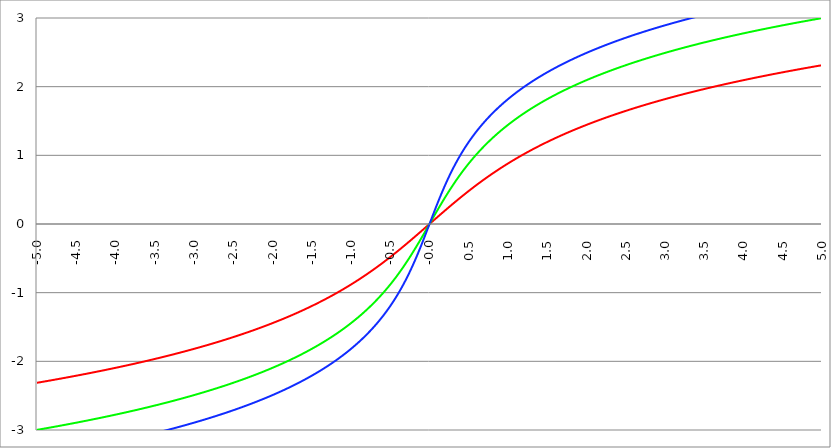
| Category | Series 1 | Series 0 | Series 2 |
|---|---|---|---|
| -5.0 | -2.312 | -2.998 | -3.402 |
| -4.995 | -2.311 | -2.997 | -3.401 |
| -4.99 | -2.31 | -2.996 | -3.4 |
| -4.985 | -2.309 | -2.995 | -3.399 |
| -4.98 | -2.309 | -2.994 | -3.398 |
| -4.975 | -2.308 | -2.993 | -3.397 |
| -4.97 | -2.307 | -2.992 | -3.396 |
| -4.965000000000001 | -2.306 | -2.991 | -3.395 |
| -4.960000000000001 | -2.305 | -2.99 | -3.394 |
| -4.955000000000001 | -2.304 | -2.989 | -3.393 |
| -4.950000000000001 | -2.303 | -2.988 | -3.392 |
| -4.945000000000001 | -2.302 | -2.987 | -3.391 |
| -4.940000000000001 | -2.301 | -2.986 | -3.39 |
| -4.935000000000001 | -2.3 | -2.985 | -3.389 |
| -4.930000000000001 | -2.299 | -2.984 | -3.388 |
| -4.925000000000002 | -2.298 | -2.983 | -3.387 |
| -4.920000000000002 | -2.297 | -2.982 | -3.386 |
| -4.915000000000002 | -2.296 | -2.981 | -3.385 |
| -4.910000000000002 | -2.295 | -2.98 | -3.384 |
| -4.905000000000002 | -2.294 | -2.979 | -3.383 |
| -4.900000000000002 | -2.293 | -2.978 | -3.382 |
| -4.895000000000002 | -2.292 | -2.977 | -3.381 |
| -4.890000000000002 | -2.291 | -2.976 | -3.38 |
| -4.885000000000002 | -2.29 | -2.975 | -3.379 |
| -4.880000000000002 | -2.289 | -2.974 | -3.378 |
| -4.875000000000003 | -2.288 | -2.973 | -3.377 |
| -4.870000000000003 | -2.287 | -2.972 | -3.376 |
| -4.865000000000003 | -2.286 | -2.971 | -3.375 |
| -4.860000000000003 | -2.285 | -2.97 | -3.374 |
| -4.855000000000003 | -2.284 | -2.969 | -3.373 |
| -4.850000000000003 | -2.283 | -2.968 | -3.372 |
| -4.845000000000003 | -2.282 | -2.967 | -3.371 |
| -4.840000000000003 | -2.281 | -2.966 | -3.37 |
| -4.835000000000003 | -2.28 | -2.965 | -3.369 |
| -4.830000000000004 | -2.279 | -2.964 | -3.368 |
| -4.825000000000004 | -2.278 | -2.963 | -3.367 |
| -4.820000000000004 | -2.277 | -2.962 | -3.366 |
| -4.815000000000004 | -2.275 | -2.961 | -3.365 |
| -4.810000000000004 | -2.274 | -2.96 | -3.364 |
| -4.805000000000004 | -2.273 | -2.959 | -3.363 |
| -4.800000000000004 | -2.272 | -2.958 | -3.362 |
| -4.795000000000004 | -2.271 | -2.957 | -3.361 |
| -4.790000000000004 | -2.27 | -2.956 | -3.359 |
| -4.785000000000004 | -2.269 | -2.954 | -3.358 |
| -4.780000000000004 | -2.268 | -2.953 | -3.357 |
| -4.775000000000004 | -2.267 | -2.952 | -3.356 |
| -4.770000000000004 | -2.266 | -2.951 | -3.355 |
| -4.765000000000005 | -2.265 | -2.95 | -3.354 |
| -4.760000000000005 | -2.264 | -2.949 | -3.353 |
| -4.755000000000005 | -2.263 | -2.948 | -3.352 |
| -4.750000000000005 | -2.262 | -2.947 | -3.351 |
| -4.745000000000005 | -2.261 | -2.946 | -3.35 |
| -4.740000000000005 | -2.26 | -2.945 | -3.349 |
| -4.735000000000005 | -2.259 | -2.944 | -3.348 |
| -4.730000000000005 | -2.258 | -2.943 | -3.347 |
| -4.725000000000006 | -2.257 | -2.942 | -3.346 |
| -4.720000000000006 | -2.256 | -2.941 | -3.345 |
| -4.715000000000006 | -2.255 | -2.94 | -3.344 |
| -4.710000000000006 | -2.254 | -2.939 | -3.343 |
| -4.705000000000006 | -2.253 | -2.938 | -3.342 |
| -4.700000000000006 | -2.252 | -2.937 | -3.341 |
| -4.695000000000006 | -2.251 | -2.936 | -3.34 |
| -4.690000000000006 | -2.25 | -2.935 | -3.338 |
| -4.685000000000007 | -2.249 | -2.933 | -3.337 |
| -4.680000000000007 | -2.248 | -2.932 | -3.336 |
| -4.675000000000007 | -2.247 | -2.931 | -3.335 |
| -4.670000000000007 | -2.246 | -2.93 | -3.334 |
| -4.665000000000007 | -2.245 | -2.929 | -3.333 |
| -4.660000000000007 | -2.243 | -2.928 | -3.332 |
| -4.655000000000007 | -2.242 | -2.927 | -3.331 |
| -4.650000000000007 | -2.241 | -2.926 | -3.33 |
| -4.645000000000007 | -2.24 | -2.925 | -3.329 |
| -4.640000000000008 | -2.239 | -2.924 | -3.328 |
| -4.635000000000008 | -2.238 | -2.923 | -3.327 |
| -4.630000000000008 | -2.237 | -2.922 | -3.326 |
| -4.625000000000008 | -2.236 | -2.921 | -3.325 |
| -4.620000000000008 | -2.235 | -2.92 | -3.323 |
| -4.615000000000008 | -2.234 | -2.919 | -3.322 |
| -4.610000000000008 | -2.233 | -2.917 | -3.321 |
| -4.605000000000008 | -2.232 | -2.916 | -3.32 |
| -4.600000000000008 | -2.231 | -2.915 | -3.319 |
| -4.595000000000009 | -2.23 | -2.914 | -3.318 |
| -4.590000000000009 | -2.229 | -2.913 | -3.317 |
| -4.585000000000009 | -2.228 | -2.912 | -3.316 |
| -4.580000000000009 | -2.227 | -2.911 | -3.315 |
| -4.57500000000001 | -2.225 | -2.91 | -3.314 |
| -4.57000000000001 | -2.224 | -2.909 | -3.313 |
| -4.565000000000009 | -2.223 | -2.908 | -3.312 |
| -4.560000000000009 | -2.222 | -2.907 | -3.31 |
| -4.555000000000009 | -2.221 | -2.906 | -3.309 |
| -4.55000000000001 | -2.22 | -2.904 | -3.308 |
| -4.54500000000001 | -2.219 | -2.903 | -3.307 |
| -4.54000000000001 | -2.218 | -2.902 | -3.306 |
| -4.53500000000001 | -2.217 | -2.901 | -3.305 |
| -4.53000000000001 | -2.216 | -2.9 | -3.304 |
| -4.52500000000001 | -2.215 | -2.899 | -3.303 |
| -4.52000000000001 | -2.214 | -2.898 | -3.302 |
| -4.51500000000001 | -2.213 | -2.897 | -3.301 |
| -4.51000000000001 | -2.212 | -2.896 | -3.299 |
| -4.505000000000011 | -2.21 | -2.895 | -3.298 |
| -4.500000000000011 | -2.209 | -2.893 | -3.297 |
| -4.495000000000011 | -2.208 | -2.892 | -3.296 |
| -4.490000000000011 | -2.207 | -2.891 | -3.295 |
| -4.485000000000011 | -2.206 | -2.89 | -3.294 |
| -4.480000000000011 | -2.205 | -2.889 | -3.293 |
| -4.475000000000011 | -2.204 | -2.888 | -3.292 |
| -4.470000000000011 | -2.203 | -2.887 | -3.291 |
| -4.465000000000011 | -2.202 | -2.886 | -3.289 |
| -4.460000000000011 | -2.201 | -2.885 | -3.288 |
| -4.455000000000012 | -2.2 | -2.883 | -3.287 |
| -4.450000000000012 | -2.198 | -2.882 | -3.286 |
| -4.445000000000012 | -2.197 | -2.881 | -3.285 |
| -4.440000000000012 | -2.196 | -2.88 | -3.284 |
| -4.435000000000012 | -2.195 | -2.879 | -3.283 |
| -4.430000000000012 | -2.194 | -2.878 | -3.282 |
| -4.425000000000012 | -2.193 | -2.877 | -3.28 |
| -4.420000000000012 | -2.192 | -2.876 | -3.279 |
| -4.415000000000012 | -2.191 | -2.874 | -3.278 |
| -4.410000000000013 | -2.19 | -2.873 | -3.277 |
| -4.405000000000013 | -2.189 | -2.872 | -3.276 |
| -4.400000000000013 | -2.187 | -2.871 | -3.275 |
| -4.395000000000013 | -2.186 | -2.87 | -3.274 |
| -4.390000000000013 | -2.185 | -2.869 | -3.273 |
| -4.385000000000013 | -2.184 | -2.868 | -3.271 |
| -4.380000000000013 | -2.183 | -2.867 | -3.27 |
| -4.375000000000013 | -2.182 | -2.865 | -3.269 |
| -4.370000000000013 | -2.181 | -2.864 | -3.268 |
| -4.365000000000013 | -2.18 | -2.863 | -3.267 |
| -4.360000000000014 | -2.179 | -2.862 | -3.266 |
| -4.355000000000014 | -2.177 | -2.861 | -3.265 |
| -4.350000000000014 | -2.176 | -2.86 | -3.263 |
| -4.345000000000014 | -2.175 | -2.859 | -3.262 |
| -4.340000000000014 | -2.174 | -2.857 | -3.261 |
| -4.335000000000014 | -2.173 | -2.856 | -3.26 |
| -4.330000000000014 | -2.172 | -2.855 | -3.259 |
| -4.325000000000014 | -2.171 | -2.854 | -3.258 |
| -4.320000000000014 | -2.17 | -2.853 | -3.256 |
| -4.315000000000015 | -2.168 | -2.852 | -3.255 |
| -4.310000000000015 | -2.167 | -2.851 | -3.254 |
| -4.305000000000015 | -2.166 | -2.849 | -3.253 |
| -4.300000000000015 | -2.165 | -2.848 | -3.252 |
| -4.295000000000015 | -2.164 | -2.847 | -3.251 |
| -4.290000000000015 | -2.163 | -2.846 | -3.25 |
| -4.285000000000015 | -2.162 | -2.845 | -3.248 |
| -4.280000000000015 | -2.16 | -2.844 | -3.247 |
| -4.275000000000015 | -2.159 | -2.842 | -3.246 |
| -4.270000000000015 | -2.158 | -2.841 | -3.245 |
| -4.265000000000016 | -2.157 | -2.84 | -3.244 |
| -4.260000000000016 | -2.156 | -2.839 | -3.243 |
| -4.255000000000016 | -2.155 | -2.838 | -3.241 |
| -4.250000000000016 | -2.154 | -2.837 | -3.24 |
| -4.245000000000016 | -2.152 | -2.835 | -3.239 |
| -4.240000000000016 | -2.151 | -2.834 | -3.238 |
| -4.235000000000016 | -2.15 | -2.833 | -3.237 |
| -4.230000000000016 | -2.149 | -2.832 | -3.236 |
| -4.225000000000017 | -2.148 | -2.831 | -3.234 |
| -4.220000000000017 | -2.147 | -2.83 | -3.233 |
| -4.215000000000017 | -2.146 | -2.828 | -3.232 |
| -4.210000000000017 | -2.144 | -2.827 | -3.231 |
| -4.205000000000017 | -2.143 | -2.826 | -3.23 |
| -4.200000000000017 | -2.142 | -2.825 | -3.228 |
| -4.195000000000017 | -2.141 | -2.824 | -3.227 |
| -4.190000000000017 | -2.14 | -2.823 | -3.226 |
| -4.185000000000017 | -2.139 | -2.821 | -3.225 |
| -4.180000000000017 | -2.137 | -2.82 | -3.224 |
| -4.175000000000018 | -2.136 | -2.819 | -3.222 |
| -4.170000000000018 | -2.135 | -2.818 | -3.221 |
| -4.165000000000018 | -2.134 | -2.817 | -3.22 |
| -4.160000000000018 | -2.133 | -2.815 | -3.219 |
| -4.155000000000018 | -2.132 | -2.814 | -3.218 |
| -4.150000000000018 | -2.13 | -2.813 | -3.216 |
| -4.145000000000018 | -2.129 | -2.812 | -3.215 |
| -4.140000000000018 | -2.128 | -2.811 | -3.214 |
| -4.135000000000018 | -2.127 | -2.809 | -3.213 |
| -4.130000000000019 | -2.126 | -2.808 | -3.212 |
| -4.125000000000019 | -2.125 | -2.807 | -3.21 |
| -4.120000000000019 | -2.123 | -2.806 | -3.209 |
| -4.115000000000019 | -2.122 | -2.805 | -3.208 |
| -4.110000000000019 | -2.121 | -2.803 | -3.207 |
| -4.105000000000019 | -2.12 | -2.802 | -3.206 |
| -4.100000000000019 | -2.119 | -2.801 | -3.204 |
| -4.095000000000019 | -2.117 | -2.8 | -3.203 |
| -4.090000000000019 | -2.116 | -2.799 | -3.202 |
| -4.085000000000019 | -2.115 | -2.797 | -3.201 |
| -4.08000000000002 | -2.114 | -2.796 | -3.2 |
| -4.07500000000002 | -2.113 | -2.795 | -3.198 |
| -4.07000000000002 | -2.112 | -2.794 | -3.197 |
| -4.06500000000002 | -2.11 | -2.792 | -3.196 |
| -4.06000000000002 | -2.109 | -2.791 | -3.195 |
| -4.05500000000002 | -2.108 | -2.79 | -3.193 |
| -4.05000000000002 | -2.107 | -2.789 | -3.192 |
| -4.04500000000002 | -2.106 | -2.788 | -3.191 |
| -4.04000000000002 | -2.104 | -2.786 | -3.19 |
| -4.03500000000002 | -2.103 | -2.785 | -3.188 |
| -4.03000000000002 | -2.102 | -2.784 | -3.187 |
| -4.025000000000021 | -2.101 | -2.783 | -3.186 |
| -4.020000000000021 | -2.1 | -2.781 | -3.185 |
| -4.015000000000021 | -2.098 | -2.78 | -3.184 |
| -4.010000000000021 | -2.097 | -2.779 | -3.182 |
| -4.005000000000021 | -2.096 | -2.778 | -3.181 |
| -4.000000000000021 | -2.095 | -2.776 | -3.18 |
| -3.995000000000021 | -2.093 | -2.775 | -3.179 |
| -3.990000000000021 | -2.092 | -2.774 | -3.177 |
| -3.985000000000022 | -2.091 | -2.773 | -3.176 |
| -3.980000000000022 | -2.09 | -2.771 | -3.175 |
| -3.975000000000022 | -2.089 | -2.77 | -3.174 |
| -3.970000000000022 | -2.087 | -2.769 | -3.172 |
| -3.965000000000022 | -2.086 | -2.768 | -3.171 |
| -3.960000000000022 | -2.085 | -2.767 | -3.17 |
| -3.955000000000022 | -2.084 | -2.765 | -3.169 |
| -3.950000000000022 | -2.083 | -2.764 | -3.167 |
| -3.945000000000022 | -2.081 | -2.763 | -3.166 |
| -3.940000000000023 | -2.08 | -2.761 | -3.165 |
| -3.935000000000023 | -2.079 | -2.76 | -3.163 |
| -3.930000000000023 | -2.078 | -2.759 | -3.162 |
| -3.925000000000023 | -2.076 | -2.758 | -3.161 |
| -3.920000000000023 | -2.075 | -2.756 | -3.16 |
| -3.915000000000023 | -2.074 | -2.755 | -3.158 |
| -3.910000000000023 | -2.073 | -2.754 | -3.157 |
| -3.905000000000023 | -2.071 | -2.753 | -3.156 |
| -3.900000000000023 | -2.07 | -2.751 | -3.155 |
| -3.895000000000023 | -2.069 | -2.75 | -3.153 |
| -3.890000000000024 | -2.068 | -2.749 | -3.152 |
| -3.885000000000024 | -2.066 | -2.748 | -3.151 |
| -3.880000000000024 | -2.065 | -2.746 | -3.149 |
| -3.875000000000024 | -2.064 | -2.745 | -3.148 |
| -3.870000000000024 | -2.063 | -2.744 | -3.147 |
| -3.865000000000024 | -2.061 | -2.742 | -3.146 |
| -3.860000000000024 | -2.06 | -2.741 | -3.144 |
| -3.855000000000024 | -2.059 | -2.74 | -3.143 |
| -3.850000000000024 | -2.058 | -2.739 | -3.142 |
| -3.845000000000025 | -2.056 | -2.737 | -3.14 |
| -3.840000000000025 | -2.055 | -2.736 | -3.139 |
| -3.835000000000025 | -2.054 | -2.735 | -3.138 |
| -3.830000000000025 | -2.053 | -2.733 | -3.137 |
| -3.825000000000025 | -2.051 | -2.732 | -3.135 |
| -3.820000000000025 | -2.05 | -2.731 | -3.134 |
| -3.815000000000025 | -2.049 | -2.73 | -3.133 |
| -3.810000000000025 | -2.048 | -2.728 | -3.131 |
| -3.805000000000025 | -2.046 | -2.727 | -3.13 |
| -3.800000000000026 | -2.045 | -2.726 | -3.129 |
| -3.795000000000026 | -2.044 | -2.724 | -3.127 |
| -3.790000000000026 | -2.042 | -2.723 | -3.126 |
| -3.785000000000026 | -2.041 | -2.722 | -3.125 |
| -3.780000000000026 | -2.04 | -2.72 | -3.123 |
| -3.775000000000026 | -2.039 | -2.719 | -3.122 |
| -3.770000000000026 | -2.037 | -2.718 | -3.121 |
| -3.765000000000026 | -2.036 | -2.716 | -3.119 |
| -3.760000000000026 | -2.035 | -2.715 | -3.118 |
| -3.755000000000026 | -2.034 | -2.714 | -3.117 |
| -3.750000000000027 | -2.032 | -2.712 | -3.115 |
| -3.745000000000027 | -2.031 | -2.711 | -3.114 |
| -3.740000000000027 | -2.03 | -2.71 | -3.113 |
| -3.735000000000027 | -2.028 | -2.708 | -3.111 |
| -3.730000000000027 | -2.027 | -2.707 | -3.11 |
| -3.725000000000027 | -2.026 | -2.706 | -3.109 |
| -3.720000000000027 | -2.024 | -2.705 | -3.107 |
| -3.715000000000027 | -2.023 | -2.703 | -3.106 |
| -3.710000000000027 | -2.022 | -2.702 | -3.105 |
| -3.705000000000028 | -2.021 | -2.7 | -3.103 |
| -3.700000000000028 | -2.019 | -2.699 | -3.102 |
| -3.695000000000028 | -2.018 | -2.698 | -3.101 |
| -3.690000000000028 | -2.017 | -2.696 | -3.099 |
| -3.685000000000028 | -2.015 | -2.695 | -3.098 |
| -3.680000000000028 | -2.014 | -2.694 | -3.097 |
| -3.675000000000028 | -2.013 | -2.692 | -3.095 |
| -3.670000000000028 | -2.011 | -2.691 | -3.094 |
| -3.665000000000028 | -2.01 | -2.69 | -3.093 |
| -3.660000000000028 | -2.009 | -2.688 | -3.091 |
| -3.655000000000029 | -2.007 | -2.687 | -3.09 |
| -3.650000000000029 | -2.006 | -2.686 | -3.089 |
| -3.645000000000029 | -2.005 | -2.684 | -3.087 |
| -3.640000000000029 | -2.003 | -2.683 | -3.086 |
| -3.635000000000029 | -2.002 | -2.682 | -3.084 |
| -3.630000000000029 | -2.001 | -2.68 | -3.083 |
| -3.625000000000029 | -2 | -2.679 | -3.082 |
| -3.620000000000029 | -1.998 | -2.678 | -3.08 |
| -3.615000000000029 | -1.997 | -2.676 | -3.079 |
| -3.61000000000003 | -1.996 | -2.675 | -3.078 |
| -3.60500000000003 | -1.994 | -2.673 | -3.076 |
| -3.60000000000003 | -1.993 | -2.672 | -3.075 |
| -3.59500000000003 | -1.991 | -2.671 | -3.073 |
| -3.59000000000003 | -1.99 | -2.669 | -3.072 |
| -3.58500000000003 | -1.989 | -2.668 | -3.071 |
| -3.58000000000003 | -1.987 | -2.666 | -3.069 |
| -3.57500000000003 | -1.986 | -2.665 | -3.068 |
| -3.57000000000003 | -1.985 | -2.664 | -3.066 |
| -3.565000000000031 | -1.983 | -2.662 | -3.065 |
| -3.560000000000031 | -1.982 | -2.661 | -3.064 |
| -3.555000000000031 | -1.981 | -2.66 | -3.062 |
| -3.550000000000031 | -1.979 | -2.658 | -3.061 |
| -3.545000000000031 | -1.978 | -2.657 | -3.06 |
| -3.540000000000031 | -1.977 | -2.655 | -3.058 |
| -3.535000000000031 | -1.975 | -2.654 | -3.057 |
| -3.530000000000031 | -1.974 | -2.653 | -3.055 |
| -3.525000000000031 | -1.973 | -2.651 | -3.054 |
| -3.520000000000032 | -1.971 | -2.65 | -3.052 |
| -3.515000000000032 | -1.97 | -2.648 | -3.051 |
| -3.510000000000032 | -1.968 | -2.647 | -3.05 |
| -3.505000000000032 | -1.967 | -2.646 | -3.048 |
| -3.500000000000032 | -1.966 | -2.644 | -3.047 |
| -3.495000000000032 | -1.964 | -2.643 | -3.045 |
| -3.490000000000032 | -1.963 | -2.641 | -3.044 |
| -3.485000000000032 | -1.962 | -2.64 | -3.043 |
| -3.480000000000032 | -1.96 | -2.638 | -3.041 |
| -3.475000000000032 | -1.959 | -2.637 | -3.04 |
| -3.470000000000033 | -1.957 | -2.636 | -3.038 |
| -3.465000000000033 | -1.956 | -2.634 | -3.037 |
| -3.460000000000033 | -1.955 | -2.633 | -3.035 |
| -3.455000000000033 | -1.953 | -2.631 | -3.034 |
| -3.450000000000033 | -1.952 | -2.63 | -3.032 |
| -3.445000000000033 | -1.951 | -2.628 | -3.031 |
| -3.440000000000033 | -1.949 | -2.627 | -3.03 |
| -3.435000000000033 | -1.948 | -2.626 | -3.028 |
| -3.430000000000033 | -1.946 | -2.624 | -3.027 |
| -3.425000000000034 | -1.945 | -2.623 | -3.025 |
| -3.420000000000034 | -1.944 | -2.621 | -3.024 |
| -3.415000000000034 | -1.942 | -2.62 | -3.022 |
| -3.410000000000034 | -1.941 | -2.618 | -3.021 |
| -3.405000000000034 | -1.939 | -2.617 | -3.019 |
| -3.400000000000034 | -1.938 | -2.615 | -3.018 |
| -3.395000000000034 | -1.936 | -2.614 | -3.016 |
| -3.390000000000034 | -1.935 | -2.613 | -3.015 |
| -3.385000000000034 | -1.934 | -2.611 | -3.014 |
| -3.380000000000034 | -1.932 | -2.61 | -3.012 |
| -3.375000000000035 | -1.931 | -2.608 | -3.011 |
| -3.370000000000035 | -1.929 | -2.607 | -3.009 |
| -3.365000000000035 | -1.928 | -2.605 | -3.008 |
| -3.360000000000035 | -1.927 | -2.604 | -3.006 |
| -3.355000000000035 | -1.925 | -2.602 | -3.005 |
| -3.350000000000035 | -1.924 | -2.601 | -3.003 |
| -3.345000000000035 | -1.922 | -2.599 | -3.002 |
| -3.340000000000035 | -1.921 | -2.598 | -3 |
| -3.335000000000035 | -1.919 | -2.596 | -2.999 |
| -3.330000000000036 | -1.918 | -2.595 | -2.997 |
| -3.325000000000036 | -1.916 | -2.593 | -2.996 |
| -3.320000000000036 | -1.915 | -2.592 | -2.994 |
| -3.315000000000036 | -1.914 | -2.59 | -2.993 |
| -3.310000000000036 | -1.912 | -2.589 | -2.991 |
| -3.305000000000036 | -1.911 | -2.587 | -2.99 |
| -3.300000000000036 | -1.909 | -2.586 | -2.988 |
| -3.295000000000036 | -1.908 | -2.584 | -2.987 |
| -3.290000000000036 | -1.906 | -2.583 | -2.985 |
| -3.285000000000036 | -1.905 | -2.581 | -2.984 |
| -3.280000000000036 | -1.903 | -2.58 | -2.982 |
| -3.275000000000037 | -1.902 | -2.578 | -2.981 |
| -3.270000000000037 | -1.901 | -2.577 | -2.979 |
| -3.265000000000037 | -1.899 | -2.575 | -2.978 |
| -3.260000000000037 | -1.898 | -2.574 | -2.976 |
| -3.255000000000037 | -1.896 | -2.572 | -2.975 |
| -3.250000000000037 | -1.895 | -2.571 | -2.973 |
| -3.245000000000037 | -1.893 | -2.569 | -2.972 |
| -3.240000000000037 | -1.892 | -2.568 | -2.97 |
| -3.235000000000038 | -1.89 | -2.566 | -2.968 |
| -3.230000000000038 | -1.889 | -2.565 | -2.967 |
| -3.225000000000038 | -1.887 | -2.563 | -2.965 |
| -3.220000000000038 | -1.886 | -2.562 | -2.964 |
| -3.215000000000038 | -1.884 | -2.56 | -2.962 |
| -3.210000000000038 | -1.883 | -2.559 | -2.961 |
| -3.205000000000038 | -1.881 | -2.557 | -2.959 |
| -3.200000000000038 | -1.88 | -2.555 | -2.958 |
| -3.195000000000038 | -1.878 | -2.554 | -2.956 |
| -3.190000000000039 | -1.877 | -2.552 | -2.954 |
| -3.185000000000039 | -1.875 | -2.551 | -2.953 |
| -3.180000000000039 | -1.874 | -2.549 | -2.951 |
| -3.175000000000039 | -1.872 | -2.548 | -2.95 |
| -3.170000000000039 | -1.871 | -2.546 | -2.948 |
| -3.16500000000004 | -1.869 | -2.545 | -2.947 |
| -3.16000000000004 | -1.868 | -2.543 | -2.945 |
| -3.155000000000039 | -1.866 | -2.542 | -2.944 |
| -3.150000000000039 | -1.865 | -2.54 | -2.942 |
| -3.14500000000004 | -1.863 | -2.538 | -2.94 |
| -3.14000000000004 | -1.862 | -2.537 | -2.939 |
| -3.13500000000004 | -1.86 | -2.535 | -2.937 |
| -3.13000000000004 | -1.859 | -2.534 | -2.936 |
| -3.12500000000004 | -1.857 | -2.532 | -2.934 |
| -3.12000000000004 | -1.856 | -2.53 | -2.932 |
| -3.11500000000004 | -1.854 | -2.529 | -2.931 |
| -3.11000000000004 | -1.853 | -2.527 | -2.929 |
| -3.10500000000004 | -1.851 | -2.526 | -2.928 |
| -3.10000000000004 | -1.85 | -2.524 | -2.926 |
| -3.095000000000041 | -1.848 | -2.523 | -2.924 |
| -3.090000000000041 | -1.847 | -2.521 | -2.923 |
| -3.085000000000041 | -1.845 | -2.519 | -2.921 |
| -3.080000000000041 | -1.843 | -2.518 | -2.92 |
| -3.075000000000041 | -1.842 | -2.516 | -2.918 |
| -3.070000000000041 | -1.84 | -2.515 | -2.916 |
| -3.065000000000041 | -1.839 | -2.513 | -2.915 |
| -3.060000000000041 | -1.837 | -2.511 | -2.913 |
| -3.055000000000041 | -1.836 | -2.51 | -2.912 |
| -3.050000000000042 | -1.834 | -2.508 | -2.91 |
| -3.045000000000042 | -1.833 | -2.506 | -2.908 |
| -3.040000000000042 | -1.831 | -2.505 | -2.907 |
| -3.035000000000042 | -1.829 | -2.503 | -2.905 |
| -3.030000000000042 | -1.828 | -2.502 | -2.903 |
| -3.025000000000042 | -1.826 | -2.5 | -2.902 |
| -3.020000000000042 | -1.825 | -2.498 | -2.9 |
| -3.015000000000042 | -1.823 | -2.497 | -2.898 |
| -3.010000000000042 | -1.822 | -2.495 | -2.897 |
| -3.005000000000043 | -1.82 | -2.493 | -2.895 |
| -3.000000000000043 | -1.818 | -2.492 | -2.893 |
| -2.995000000000043 | -1.817 | -2.49 | -2.892 |
| -2.990000000000043 | -1.815 | -2.488 | -2.89 |
| -2.985000000000043 | -1.814 | -2.487 | -2.888 |
| -2.980000000000043 | -1.812 | -2.485 | -2.887 |
| -2.975000000000043 | -1.811 | -2.484 | -2.885 |
| -2.970000000000043 | -1.809 | -2.482 | -2.883 |
| -2.965000000000043 | -1.807 | -2.48 | -2.882 |
| -2.960000000000043 | -1.806 | -2.479 | -2.88 |
| -2.955000000000044 | -1.804 | -2.477 | -2.878 |
| -2.950000000000044 | -1.803 | -2.475 | -2.877 |
| -2.945000000000044 | -1.801 | -2.474 | -2.875 |
| -2.940000000000044 | -1.799 | -2.472 | -2.873 |
| -2.935000000000044 | -1.798 | -2.47 | -2.872 |
| -2.930000000000044 | -1.796 | -2.468 | -2.87 |
| -2.925000000000044 | -1.794 | -2.467 | -2.868 |
| -2.920000000000044 | -1.793 | -2.465 | -2.867 |
| -2.915000000000044 | -1.791 | -2.463 | -2.865 |
| -2.910000000000045 | -1.79 | -2.462 | -2.863 |
| -2.905000000000045 | -1.788 | -2.46 | -2.861 |
| -2.900000000000045 | -1.786 | -2.458 | -2.86 |
| -2.895000000000045 | -1.785 | -2.457 | -2.858 |
| -2.890000000000045 | -1.783 | -2.455 | -2.856 |
| -2.885000000000045 | -1.781 | -2.453 | -2.855 |
| -2.880000000000045 | -1.78 | -2.452 | -2.853 |
| -2.875000000000045 | -1.778 | -2.45 | -2.851 |
| -2.870000000000045 | -1.777 | -2.448 | -2.849 |
| -2.865000000000045 | -1.775 | -2.446 | -2.848 |
| -2.860000000000046 | -1.773 | -2.445 | -2.846 |
| -2.855000000000046 | -1.772 | -2.443 | -2.844 |
| -2.850000000000046 | -1.77 | -2.441 | -2.842 |
| -2.845000000000046 | -1.768 | -2.439 | -2.841 |
| -2.840000000000046 | -1.767 | -2.438 | -2.839 |
| -2.835000000000046 | -1.765 | -2.436 | -2.837 |
| -2.830000000000046 | -1.763 | -2.434 | -2.835 |
| -2.825000000000046 | -1.762 | -2.433 | -2.834 |
| -2.820000000000046 | -1.76 | -2.431 | -2.832 |
| -2.815000000000047 | -1.758 | -2.429 | -2.83 |
| -2.810000000000047 | -1.757 | -2.427 | -2.828 |
| -2.805000000000047 | -1.755 | -2.426 | -2.827 |
| -2.800000000000047 | -1.753 | -2.424 | -2.825 |
| -2.795000000000047 | -1.752 | -2.422 | -2.823 |
| -2.790000000000047 | -1.75 | -2.42 | -2.821 |
| -2.785000000000047 | -1.748 | -2.419 | -2.82 |
| -2.780000000000047 | -1.746 | -2.417 | -2.818 |
| -2.775000000000047 | -1.745 | -2.415 | -2.816 |
| -2.770000000000047 | -1.743 | -2.413 | -2.814 |
| -2.765000000000048 | -1.741 | -2.411 | -2.812 |
| -2.760000000000048 | -1.74 | -2.41 | -2.811 |
| -2.755000000000048 | -1.738 | -2.408 | -2.809 |
| -2.750000000000048 | -1.736 | -2.406 | -2.807 |
| -2.745000000000048 | -1.735 | -2.404 | -2.805 |
| -2.740000000000048 | -1.733 | -2.402 | -2.803 |
| -2.735000000000048 | -1.731 | -2.401 | -2.802 |
| -2.730000000000048 | -1.729 | -2.399 | -2.8 |
| -2.725000000000048 | -1.728 | -2.397 | -2.798 |
| -2.720000000000049 | -1.726 | -2.395 | -2.796 |
| -2.715000000000049 | -1.724 | -2.393 | -2.794 |
| -2.710000000000049 | -1.723 | -2.392 | -2.792 |
| -2.705000000000049 | -1.721 | -2.39 | -2.791 |
| -2.700000000000049 | -1.719 | -2.388 | -2.789 |
| -2.695000000000049 | -1.717 | -2.386 | -2.787 |
| -2.690000000000049 | -1.716 | -2.384 | -2.785 |
| -2.685000000000049 | -1.714 | -2.383 | -2.783 |
| -2.680000000000049 | -1.712 | -2.381 | -2.781 |
| -2.675000000000049 | -1.71 | -2.379 | -2.78 |
| -2.67000000000005 | -1.709 | -2.377 | -2.778 |
| -2.66500000000005 | -1.707 | -2.375 | -2.776 |
| -2.66000000000005 | -1.705 | -2.373 | -2.774 |
| -2.65500000000005 | -1.703 | -2.371 | -2.772 |
| -2.65000000000005 | -1.702 | -2.37 | -2.77 |
| -2.64500000000005 | -1.7 | -2.368 | -2.768 |
| -2.64000000000005 | -1.698 | -2.366 | -2.767 |
| -2.63500000000005 | -1.696 | -2.364 | -2.765 |
| -2.63000000000005 | -1.694 | -2.362 | -2.763 |
| -2.625000000000051 | -1.693 | -2.36 | -2.761 |
| -2.620000000000051 | -1.691 | -2.358 | -2.759 |
| -2.615000000000051 | -1.689 | -2.357 | -2.757 |
| -2.610000000000051 | -1.687 | -2.355 | -2.755 |
| -2.605000000000051 | -1.686 | -2.353 | -2.753 |
| -2.600000000000051 | -1.684 | -2.351 | -2.751 |
| -2.595000000000051 | -1.682 | -2.349 | -2.749 |
| -2.590000000000051 | -1.68 | -2.347 | -2.748 |
| -2.585000000000051 | -1.678 | -2.345 | -2.746 |
| -2.580000000000052 | -1.677 | -2.343 | -2.744 |
| -2.575000000000052 | -1.675 | -2.341 | -2.742 |
| -2.570000000000052 | -1.673 | -2.34 | -2.74 |
| -2.565000000000052 | -1.671 | -2.338 | -2.738 |
| -2.560000000000052 | -1.669 | -2.336 | -2.736 |
| -2.555000000000052 | -1.667 | -2.334 | -2.734 |
| -2.550000000000052 | -1.666 | -2.332 | -2.732 |
| -2.545000000000052 | -1.664 | -2.33 | -2.73 |
| -2.540000000000052 | -1.662 | -2.328 | -2.728 |
| -2.535000000000053 | -1.66 | -2.326 | -2.726 |
| -2.530000000000053 | -1.658 | -2.324 | -2.724 |
| -2.525000000000053 | -1.656 | -2.322 | -2.722 |
| -2.520000000000053 | -1.655 | -2.32 | -2.72 |
| -2.515000000000053 | -1.653 | -2.318 | -2.718 |
| -2.510000000000053 | -1.651 | -2.316 | -2.716 |
| -2.505000000000053 | -1.649 | -2.314 | -2.714 |
| -2.500000000000053 | -1.647 | -2.312 | -2.712 |
| -2.495000000000053 | -1.645 | -2.31 | -2.71 |
| -2.490000000000053 | -1.644 | -2.309 | -2.708 |
| -2.485000000000054 | -1.642 | -2.307 | -2.707 |
| -2.480000000000054 | -1.64 | -2.305 | -2.705 |
| -2.475000000000054 | -1.638 | -2.303 | -2.703 |
| -2.470000000000054 | -1.636 | -2.301 | -2.7 |
| -2.465000000000054 | -1.634 | -2.299 | -2.698 |
| -2.460000000000054 | -1.632 | -2.297 | -2.696 |
| -2.455000000000054 | -1.63 | -2.295 | -2.694 |
| -2.450000000000054 | -1.628 | -2.293 | -2.692 |
| -2.445000000000054 | -1.627 | -2.291 | -2.69 |
| -2.440000000000055 | -1.625 | -2.289 | -2.688 |
| -2.435000000000055 | -1.623 | -2.287 | -2.686 |
| -2.430000000000055 | -1.621 | -2.285 | -2.684 |
| -2.425000000000055 | -1.619 | -2.283 | -2.682 |
| -2.420000000000055 | -1.617 | -2.281 | -2.68 |
| -2.415000000000055 | -1.615 | -2.279 | -2.678 |
| -2.410000000000055 | -1.613 | -2.277 | -2.676 |
| -2.405000000000055 | -1.611 | -2.274 | -2.674 |
| -2.400000000000055 | -1.609 | -2.272 | -2.672 |
| -2.395000000000055 | -1.608 | -2.27 | -2.67 |
| -2.390000000000056 | -1.606 | -2.268 | -2.668 |
| -2.385000000000056 | -1.604 | -2.266 | -2.666 |
| -2.380000000000056 | -1.602 | -2.264 | -2.664 |
| -2.375000000000056 | -1.6 | -2.262 | -2.662 |
| -2.370000000000056 | -1.598 | -2.26 | -2.66 |
| -2.365000000000056 | -1.596 | -2.258 | -2.657 |
| -2.360000000000056 | -1.594 | -2.256 | -2.655 |
| -2.355000000000056 | -1.592 | -2.254 | -2.653 |
| -2.350000000000056 | -1.59 | -2.252 | -2.651 |
| -2.345000000000057 | -1.588 | -2.25 | -2.649 |
| -2.340000000000057 | -1.586 | -2.248 | -2.647 |
| -2.335000000000057 | -1.584 | -2.246 | -2.645 |
| -2.330000000000057 | -1.582 | -2.243 | -2.643 |
| -2.325000000000057 | -1.58 | -2.241 | -2.641 |
| -2.320000000000057 | -1.578 | -2.239 | -2.638 |
| -2.315000000000057 | -1.576 | -2.237 | -2.636 |
| -2.310000000000057 | -1.574 | -2.235 | -2.634 |
| -2.305000000000057 | -1.572 | -2.233 | -2.632 |
| -2.300000000000058 | -1.57 | -2.231 | -2.63 |
| -2.295000000000058 | -1.568 | -2.229 | -2.628 |
| -2.290000000000058 | -1.566 | -2.227 | -2.626 |
| -2.285000000000058 | -1.564 | -2.224 | -2.623 |
| -2.280000000000058 | -1.562 | -2.222 | -2.621 |
| -2.275000000000058 | -1.56 | -2.22 | -2.619 |
| -2.270000000000058 | -1.558 | -2.218 | -2.617 |
| -2.265000000000058 | -1.556 | -2.216 | -2.615 |
| -2.260000000000058 | -1.554 | -2.214 | -2.613 |
| -2.255000000000058 | -1.552 | -2.212 | -2.61 |
| -2.250000000000059 | -1.55 | -2.209 | -2.608 |
| -2.245000000000059 | -1.548 | -2.207 | -2.606 |
| -2.240000000000059 | -1.546 | -2.205 | -2.604 |
| -2.235000000000059 | -1.544 | -2.203 | -2.602 |
| -2.23000000000006 | -1.542 | -2.201 | -2.599 |
| -2.22500000000006 | -1.54 | -2.198 | -2.597 |
| -2.22000000000006 | -1.538 | -2.196 | -2.595 |
| -2.215000000000059 | -1.536 | -2.194 | -2.593 |
| -2.210000000000059 | -1.534 | -2.192 | -2.59 |
| -2.20500000000006 | -1.532 | -2.19 | -2.588 |
| -2.20000000000006 | -1.53 | -2.187 | -2.586 |
| -2.19500000000006 | -1.528 | -2.185 | -2.584 |
| -2.19000000000006 | -1.526 | -2.183 | -2.581 |
| -2.18500000000006 | -1.523 | -2.181 | -2.579 |
| -2.18000000000006 | -1.521 | -2.179 | -2.577 |
| -2.17500000000006 | -1.519 | -2.176 | -2.575 |
| -2.17000000000006 | -1.517 | -2.174 | -2.572 |
| -2.16500000000006 | -1.515 | -2.172 | -2.57 |
| -2.160000000000061 | -1.513 | -2.17 | -2.568 |
| -2.155000000000061 | -1.511 | -2.167 | -2.565 |
| -2.150000000000061 | -1.509 | -2.165 | -2.563 |
| -2.145000000000061 | -1.507 | -2.163 | -2.561 |
| -2.140000000000061 | -1.505 | -2.16 | -2.559 |
| -2.135000000000061 | -1.502 | -2.158 | -2.556 |
| -2.130000000000061 | -1.5 | -2.156 | -2.554 |
| -2.125000000000061 | -1.498 | -2.154 | -2.552 |
| -2.120000000000061 | -1.496 | -2.151 | -2.549 |
| -2.115000000000061 | -1.494 | -2.149 | -2.547 |
| -2.110000000000062 | -1.492 | -2.147 | -2.545 |
| -2.105000000000062 | -1.49 | -2.144 | -2.542 |
| -2.100000000000062 | -1.487 | -2.142 | -2.54 |
| -2.095000000000062 | -1.485 | -2.14 | -2.538 |
| -2.090000000000062 | -1.483 | -2.137 | -2.535 |
| -2.085000000000062 | -1.481 | -2.135 | -2.533 |
| -2.080000000000062 | -1.479 | -2.133 | -2.53 |
| -2.075000000000062 | -1.477 | -2.13 | -2.528 |
| -2.070000000000062 | -1.475 | -2.128 | -2.526 |
| -2.065000000000063 | -1.472 | -2.126 | -2.523 |
| -2.060000000000063 | -1.47 | -2.123 | -2.521 |
| -2.055000000000063 | -1.468 | -2.121 | -2.519 |
| -2.050000000000063 | -1.466 | -2.119 | -2.516 |
| -2.045000000000063 | -1.464 | -2.116 | -2.514 |
| -2.040000000000063 | -1.461 | -2.114 | -2.511 |
| -2.035000000000063 | -1.459 | -2.112 | -2.509 |
| -2.030000000000063 | -1.457 | -2.109 | -2.506 |
| -2.025000000000063 | -1.455 | -2.107 | -2.504 |
| -2.020000000000064 | -1.453 | -2.104 | -2.502 |
| -2.015000000000064 | -1.45 | -2.102 | -2.499 |
| -2.010000000000064 | -1.448 | -2.1 | -2.497 |
| -2.005000000000064 | -1.446 | -2.097 | -2.494 |
| -2.000000000000064 | -1.444 | -2.095 | -2.492 |
| -1.995000000000064 | -1.441 | -2.092 | -2.489 |
| -1.990000000000064 | -1.439 | -2.09 | -2.487 |
| -1.985000000000064 | -1.437 | -2.087 | -2.484 |
| -1.980000000000064 | -1.435 | -2.085 | -2.482 |
| -1.975000000000064 | -1.432 | -2.083 | -2.479 |
| -1.970000000000065 | -1.43 | -2.08 | -2.477 |
| -1.965000000000065 | -1.428 | -2.078 | -2.474 |
| -1.960000000000065 | -1.426 | -2.075 | -2.472 |
| -1.955000000000065 | -1.423 | -2.073 | -2.469 |
| -1.950000000000065 | -1.421 | -2.07 | -2.467 |
| -1.945000000000065 | -1.419 | -2.068 | -2.464 |
| -1.940000000000065 | -1.416 | -2.065 | -2.462 |
| -1.935000000000065 | -1.414 | -2.063 | -2.459 |
| -1.930000000000065 | -1.412 | -2.06 | -2.457 |
| -1.925000000000066 | -1.41 | -2.058 | -2.454 |
| -1.920000000000066 | -1.407 | -2.055 | -2.452 |
| -1.915000000000066 | -1.405 | -2.053 | -2.449 |
| -1.910000000000066 | -1.403 | -2.05 | -2.446 |
| -1.905000000000066 | -1.4 | -2.048 | -2.444 |
| -1.900000000000066 | -1.398 | -2.045 | -2.441 |
| -1.895000000000066 | -1.396 | -2.042 | -2.439 |
| -1.890000000000066 | -1.393 | -2.04 | -2.436 |
| -1.885000000000066 | -1.391 | -2.037 | -2.433 |
| -1.880000000000066 | -1.389 | -2.035 | -2.431 |
| -1.875000000000067 | -1.386 | -2.032 | -2.428 |
| -1.870000000000067 | -1.384 | -2.03 | -2.426 |
| -1.865000000000067 | -1.382 | -2.027 | -2.423 |
| -1.860000000000067 | -1.379 | -2.024 | -2.42 |
| -1.855000000000067 | -1.377 | -2.022 | -2.418 |
| -1.850000000000067 | -1.374 | -2.019 | -2.415 |
| -1.845000000000067 | -1.372 | -2.017 | -2.412 |
| -1.840000000000067 | -1.37 | -2.014 | -2.41 |
| -1.835000000000067 | -1.367 | -2.011 | -2.407 |
| -1.830000000000068 | -1.365 | -2.009 | -2.404 |
| -1.825000000000068 | -1.363 | -2.006 | -2.402 |
| -1.820000000000068 | -1.36 | -2.003 | -2.399 |
| -1.815000000000068 | -1.358 | -2.001 | -2.396 |
| -1.810000000000068 | -1.355 | -1.998 | -2.393 |
| -1.805000000000068 | -1.353 | -1.996 | -2.391 |
| -1.800000000000068 | -1.35 | -1.993 | -2.388 |
| -1.795000000000068 | -1.348 | -1.99 | -2.385 |
| -1.790000000000068 | -1.346 | -1.987 | -2.383 |
| -1.785000000000068 | -1.343 | -1.985 | -2.38 |
| -1.780000000000069 | -1.341 | -1.982 | -2.377 |
| -1.775000000000069 | -1.338 | -1.979 | -2.374 |
| -1.770000000000069 | -1.336 | -1.977 | -2.371 |
| -1.765000000000069 | -1.333 | -1.974 | -2.369 |
| -1.760000000000069 | -1.331 | -1.971 | -2.366 |
| -1.75500000000007 | -1.328 | -1.968 | -2.363 |
| -1.75000000000007 | -1.326 | -1.966 | -2.36 |
| -1.745000000000069 | -1.323 | -1.963 | -2.358 |
| -1.740000000000069 | -1.321 | -1.96 | -2.355 |
| -1.73500000000007 | -1.318 | -1.957 | -2.352 |
| -1.73000000000007 | -1.316 | -1.955 | -2.349 |
| -1.72500000000007 | -1.313 | -1.952 | -2.346 |
| -1.72000000000007 | -1.311 | -1.949 | -2.343 |
| -1.71500000000007 | -1.308 | -1.946 | -2.34 |
| -1.71000000000007 | -1.306 | -1.944 | -2.338 |
| -1.70500000000007 | -1.303 | -1.941 | -2.335 |
| -1.70000000000007 | -1.301 | -1.938 | -2.332 |
| -1.69500000000007 | -1.298 | -1.935 | -2.329 |
| -1.69000000000007 | -1.296 | -1.932 | -2.326 |
| -1.685000000000071 | -1.293 | -1.929 | -2.323 |
| -1.680000000000071 | -1.291 | -1.927 | -2.32 |
| -1.675000000000071 | -1.288 | -1.924 | -2.317 |
| -1.670000000000071 | -1.286 | -1.921 | -2.314 |
| -1.665000000000071 | -1.283 | -1.918 | -2.311 |
| -1.660000000000071 | -1.28 | -1.915 | -2.309 |
| -1.655000000000071 | -1.278 | -1.912 | -2.306 |
| -1.650000000000071 | -1.275 | -1.909 | -2.303 |
| -1.645000000000071 | -1.273 | -1.906 | -2.3 |
| -1.640000000000072 | -1.27 | -1.903 | -2.297 |
| -1.635000000000072 | -1.267 | -1.901 | -2.294 |
| -1.630000000000072 | -1.265 | -1.898 | -2.291 |
| -1.625000000000072 | -1.262 | -1.895 | -2.288 |
| -1.620000000000072 | -1.26 | -1.892 | -2.285 |
| -1.615000000000072 | -1.257 | -1.889 | -2.282 |
| -1.610000000000072 | -1.254 | -1.886 | -2.279 |
| -1.605000000000072 | -1.252 | -1.883 | -2.275 |
| -1.600000000000072 | -1.249 | -1.88 | -2.272 |
| -1.595000000000073 | -1.246 | -1.877 | -2.269 |
| -1.590000000000073 | -1.244 | -1.874 | -2.266 |
| -1.585000000000073 | -1.241 | -1.871 | -2.263 |
| -1.580000000000073 | -1.238 | -1.868 | -2.26 |
| -1.575000000000073 | -1.236 | -1.865 | -2.257 |
| -1.570000000000073 | -1.233 | -1.862 | -2.254 |
| -1.565000000000073 | -1.23 | -1.859 | -2.251 |
| -1.560000000000073 | -1.228 | -1.856 | -2.248 |
| -1.555000000000073 | -1.225 | -1.853 | -2.245 |
| -1.550000000000074 | -1.222 | -1.85 | -2.241 |
| -1.545000000000074 | -1.219 | -1.847 | -2.238 |
| -1.540000000000074 | -1.217 | -1.843 | -2.235 |
| -1.535000000000074 | -1.214 | -1.84 | -2.232 |
| -1.530000000000074 | -1.211 | -1.837 | -2.229 |
| -1.525000000000074 | -1.209 | -1.834 | -2.225 |
| -1.520000000000074 | -1.206 | -1.831 | -2.222 |
| -1.515000000000074 | -1.203 | -1.828 | -2.219 |
| -1.510000000000074 | -1.2 | -1.825 | -2.216 |
| -1.505000000000074 | -1.198 | -1.822 | -2.213 |
| -1.500000000000075 | -1.195 | -1.818 | -2.209 |
| -1.495000000000075 | -1.192 | -1.815 | -2.206 |
| -1.490000000000075 | -1.189 | -1.812 | -2.203 |
| -1.485000000000075 | -1.186 | -1.809 | -2.2 |
| -1.480000000000075 | -1.184 | -1.806 | -2.196 |
| -1.475000000000075 | -1.181 | -1.803 | -2.193 |
| -1.470000000000075 | -1.178 | -1.799 | -2.19 |
| -1.465000000000075 | -1.175 | -1.796 | -2.186 |
| -1.460000000000075 | -1.172 | -1.793 | -2.183 |
| -1.455000000000076 | -1.17 | -1.79 | -2.18 |
| -1.450000000000076 | -1.167 | -1.786 | -2.176 |
| -1.445000000000076 | -1.164 | -1.783 | -2.173 |
| -1.440000000000076 | -1.161 | -1.78 | -2.17 |
| -1.435000000000076 | -1.158 | -1.777 | -2.166 |
| -1.430000000000076 | -1.155 | -1.773 | -2.163 |
| -1.425000000000076 | -1.152 | -1.77 | -2.159 |
| -1.420000000000076 | -1.15 | -1.767 | -2.156 |
| -1.415000000000076 | -1.147 | -1.763 | -2.152 |
| -1.410000000000077 | -1.144 | -1.76 | -2.149 |
| -1.405000000000077 | -1.141 | -1.757 | -2.146 |
| -1.400000000000077 | -1.138 | -1.753 | -2.142 |
| -1.395000000000077 | -1.135 | -1.75 | -2.139 |
| -1.390000000000077 | -1.132 | -1.746 | -2.135 |
| -1.385000000000077 | -1.129 | -1.743 | -2.132 |
| -1.380000000000077 | -1.126 | -1.74 | -2.128 |
| -1.375000000000077 | -1.123 | -1.736 | -2.125 |
| -1.370000000000077 | -1.12 | -1.733 | -2.121 |
| -1.365000000000077 | -1.117 | -1.729 | -2.117 |
| -1.360000000000078 | -1.115 | -1.726 | -2.114 |
| -1.355000000000078 | -1.112 | -1.723 | -2.11 |
| -1.350000000000078 | -1.109 | -1.719 | -2.107 |
| -1.345000000000078 | -1.106 | -1.716 | -2.103 |
| -1.340000000000078 | -1.103 | -1.712 | -2.1 |
| -1.335000000000078 | -1.1 | -1.709 | -2.096 |
| -1.330000000000078 | -1.097 | -1.705 | -2.092 |
| -1.325000000000078 | -1.094 | -1.702 | -2.089 |
| -1.320000000000078 | -1.091 | -1.698 | -2.085 |
| -1.315000000000079 | -1.088 | -1.694 | -2.081 |
| -1.310000000000079 | -1.085 | -1.691 | -2.078 |
| -1.305000000000079 | -1.081 | -1.687 | -2.074 |
| -1.300000000000079 | -1.078 | -1.684 | -2.07 |
| -1.295000000000079 | -1.075 | -1.68 | -2.066 |
| -1.29000000000008 | -1.072 | -1.677 | -2.063 |
| -1.285000000000079 | -1.069 | -1.673 | -2.059 |
| -1.280000000000079 | -1.066 | -1.669 | -2.055 |
| -1.275000000000079 | -1.063 | -1.666 | -2.051 |
| -1.270000000000079 | -1.06 | -1.662 | -2.048 |
| -1.26500000000008 | -1.057 | -1.658 | -2.044 |
| -1.26000000000008 | -1.054 | -1.655 | -2.04 |
| -1.25500000000008 | -1.051 | -1.651 | -2.036 |
| -1.25000000000008 | -1.048 | -1.647 | -2.032 |
| -1.24500000000008 | -1.044 | -1.644 | -2.028 |
| -1.24000000000008 | -1.041 | -1.64 | -2.024 |
| -1.23500000000008 | -1.038 | -1.636 | -2.021 |
| -1.23000000000008 | -1.035 | -1.632 | -2.017 |
| -1.22500000000008 | -1.032 | -1.628 | -2.013 |
| -1.220000000000081 | -1.029 | -1.625 | -2.009 |
| -1.215000000000081 | -1.026 | -1.621 | -2.005 |
| -1.210000000000081 | -1.022 | -1.617 | -2.001 |
| -1.205000000000081 | -1.019 | -1.613 | -1.997 |
| -1.200000000000081 | -1.016 | -1.609 | -1.993 |
| -1.195000000000081 | -1.013 | -1.606 | -1.989 |
| -1.190000000000081 | -1.01 | -1.602 | -1.985 |
| -1.185000000000081 | -1.006 | -1.598 | -1.981 |
| -1.180000000000081 | -1.003 | -1.594 | -1.977 |
| -1.175000000000082 | -1 | -1.59 | -1.973 |
| -1.170000000000082 | -0.997 | -1.586 | -1.968 |
| -1.165000000000082 | -0.993 | -1.582 | -1.964 |
| -1.160000000000082 | -0.99 | -1.578 | -1.96 |
| -1.155000000000082 | -0.987 | -1.574 | -1.956 |
| -1.150000000000082 | -0.984 | -1.57 | -1.952 |
| -1.145000000000082 | -0.98 | -1.566 | -1.948 |
| -1.140000000000082 | -0.977 | -1.562 | -1.944 |
| -1.135000000000082 | -0.974 | -1.558 | -1.939 |
| -1.130000000000082 | -0.97 | -1.554 | -1.935 |
| -1.125000000000083 | -0.967 | -1.55 | -1.931 |
| -1.120000000000083 | -0.964 | -1.546 | -1.927 |
| -1.115000000000083 | -0.96 | -1.542 | -1.922 |
| -1.110000000000083 | -0.957 | -1.538 | -1.918 |
| -1.105000000000083 | -0.954 | -1.534 | -1.914 |
| -1.100000000000083 | -0.95 | -1.53 | -1.909 |
| -1.095000000000083 | -0.947 | -1.526 | -1.905 |
| -1.090000000000083 | -0.944 | -1.521 | -1.901 |
| -1.085000000000083 | -0.94 | -1.517 | -1.896 |
| -1.080000000000084 | -0.937 | -1.513 | -1.892 |
| -1.075000000000084 | -0.933 | -1.509 | -1.887 |
| -1.070000000000084 | -0.93 | -1.505 | -1.883 |
| -1.065000000000084 | -0.927 | -1.5 | -1.878 |
| -1.060000000000084 | -0.923 | -1.496 | -1.874 |
| -1.055000000000084 | -0.92 | -1.492 | -1.869 |
| -1.050000000000084 | -0.916 | -1.487 | -1.865 |
| -1.045000000000084 | -0.913 | -1.483 | -1.86 |
| -1.040000000000084 | -0.909 | -1.479 | -1.856 |
| -1.035000000000085 | -0.906 | -1.475 | -1.851 |
| -1.030000000000085 | -0.902 | -1.47 | -1.847 |
| -1.025000000000085 | -0.899 | -1.466 | -1.842 |
| -1.020000000000085 | -0.895 | -1.461 | -1.837 |
| -1.015000000000085 | -0.892 | -1.457 | -1.833 |
| -1.010000000000085 | -0.888 | -1.453 | -1.828 |
| -1.005000000000085 | -0.885 | -1.448 | -1.823 |
| -1.000000000000085 | -0.881 | -1.444 | -1.818 |
| -0.995000000000085 | -0.878 | -1.439 | -1.814 |
| -0.990000000000085 | -0.874 | -1.435 | -1.809 |
| -0.985000000000085 | -0.871 | -1.43 | -1.804 |
| -0.980000000000085 | -0.867 | -1.426 | -1.799 |
| -0.975000000000085 | -0.864 | -1.421 | -1.794 |
| -0.970000000000085 | -0.86 | -1.416 | -1.79 |
| -0.965000000000085 | -0.856 | -1.412 | -1.785 |
| -0.960000000000085 | -0.853 | -1.407 | -1.78 |
| -0.955000000000085 | -0.849 | -1.403 | -1.775 |
| -0.950000000000085 | -0.846 | -1.398 | -1.77 |
| -0.945000000000085 | -0.842 | -1.393 | -1.765 |
| -0.940000000000085 | -0.838 | -1.389 | -1.76 |
| -0.935000000000085 | -0.835 | -1.384 | -1.755 |
| -0.930000000000085 | -0.831 | -1.379 | -1.75 |
| -0.925000000000085 | -0.827 | -1.374 | -1.745 |
| -0.920000000000085 | -0.824 | -1.37 | -1.74 |
| -0.915000000000085 | -0.82 | -1.365 | -1.735 |
| -0.910000000000085 | -0.816 | -1.36 | -1.729 |
| -0.905000000000085 | -0.813 | -1.355 | -1.724 |
| -0.900000000000085 | -0.809 | -1.35 | -1.719 |
| -0.895000000000085 | -0.805 | -1.346 | -1.714 |
| -0.890000000000085 | -0.801 | -1.341 | -1.709 |
| -0.885000000000085 | -0.798 | -1.336 | -1.703 |
| -0.880000000000085 | -0.794 | -1.331 | -1.698 |
| -0.875000000000085 | -0.79 | -1.326 | -1.693 |
| -0.870000000000085 | -0.786 | -1.321 | -1.687 |
| -0.865000000000085 | -0.783 | -1.316 | -1.682 |
| -0.860000000000085 | -0.779 | -1.311 | -1.677 |
| -0.855000000000085 | -0.775 | -1.306 | -1.671 |
| -0.850000000000085 | -0.771 | -1.301 | -1.666 |
| -0.845000000000085 | -0.767 | -1.296 | -1.66 |
| -0.840000000000085 | -0.764 | -1.291 | -1.655 |
| -0.835000000000085 | -0.76 | -1.286 | -1.649 |
| -0.830000000000085 | -0.756 | -1.28 | -1.644 |
| -0.825000000000085 | -0.752 | -1.275 | -1.638 |
| -0.820000000000085 | -0.748 | -1.27 | -1.632 |
| -0.815000000000085 | -0.744 | -1.265 | -1.627 |
| -0.810000000000085 | -0.74 | -1.26 | -1.621 |
| -0.805000000000085 | -0.737 | -1.254 | -1.615 |
| -0.800000000000085 | -0.733 | -1.249 | -1.609 |
| -0.795000000000085 | -0.729 | -1.244 | -1.604 |
| -0.790000000000085 | -0.725 | -1.238 | -1.598 |
| -0.785000000000085 | -0.721 | -1.233 | -1.592 |
| -0.780000000000085 | -0.717 | -1.228 | -1.586 |
| -0.775000000000085 | -0.713 | -1.222 | -1.58 |
| -0.770000000000085 | -0.709 | -1.217 | -1.574 |
| -0.765000000000085 | -0.705 | -1.211 | -1.568 |
| -0.760000000000085 | -0.701 | -1.206 | -1.562 |
| -0.755000000000085 | -0.697 | -1.2 | -1.556 |
| -0.750000000000085 | -0.693 | -1.195 | -1.55 |
| -0.745000000000085 | -0.689 | -1.189 | -1.544 |
| -0.740000000000085 | -0.685 | -1.184 | -1.538 |
| -0.735000000000085 | -0.681 | -1.178 | -1.532 |
| -0.730000000000085 | -0.677 | -1.172 | -1.526 |
| -0.725000000000085 | -0.673 | -1.167 | -1.519 |
| -0.720000000000085 | -0.669 | -1.161 | -1.513 |
| -0.715000000000085 | -0.665 | -1.155 | -1.507 |
| -0.710000000000085 | -0.661 | -1.15 | -1.5 |
| -0.705000000000085 | -0.657 | -1.144 | -1.494 |
| -0.700000000000085 | -0.653 | -1.138 | -1.487 |
| -0.695000000000085 | -0.649 | -1.132 | -1.481 |
| -0.690000000000085 | -0.644 | -1.126 | -1.475 |
| -0.685000000000085 | -0.64 | -1.12 | -1.468 |
| -0.680000000000085 | -0.636 | -1.115 | -1.461 |
| -0.675000000000085 | -0.632 | -1.109 | -1.455 |
| -0.670000000000085 | -0.628 | -1.103 | -1.448 |
| -0.665000000000085 | -0.624 | -1.097 | -1.441 |
| -0.660000000000085 | -0.62 | -1.091 | -1.435 |
| -0.655000000000085 | -0.615 | -1.085 | -1.428 |
| -0.650000000000085 | -0.611 | -1.078 | -1.421 |
| -0.645000000000085 | -0.607 | -1.072 | -1.414 |
| -0.640000000000085 | -0.603 | -1.066 | -1.407 |
| -0.635000000000085 | -0.599 | -1.06 | -1.4 |
| -0.630000000000085 | -0.594 | -1.054 | -1.393 |
| -0.625000000000085 | -0.59 | -1.048 | -1.386 |
| -0.620000000000085 | -0.586 | -1.041 | -1.379 |
| -0.615000000000085 | -0.582 | -1.035 | -1.372 |
| -0.610000000000085 | -0.577 | -1.029 | -1.365 |
| -0.605000000000085 | -0.573 | -1.022 | -1.358 |
| -0.600000000000085 | -0.569 | -1.016 | -1.35 |
| -0.595000000000085 | -0.565 | -1.01 | -1.343 |
| -0.590000000000085 | -0.56 | -1.003 | -1.336 |
| -0.585000000000085 | -0.556 | -0.997 | -1.328 |
| -0.580000000000085 | -0.552 | -0.99 | -1.321 |
| -0.575000000000085 | -0.547 | -0.984 | -1.313 |
| -0.570000000000085 | -0.543 | -0.977 | -1.306 |
| -0.565000000000085 | -0.539 | -0.97 | -1.298 |
| -0.560000000000085 | -0.534 | -0.964 | -1.291 |
| -0.555000000000085 | -0.53 | -0.957 | -1.283 |
| -0.550000000000085 | -0.525 | -0.95 | -1.275 |
| -0.545000000000085 | -0.521 | -0.944 | -1.267 |
| -0.540000000000085 | -0.517 | -0.937 | -1.26 |
| -0.535000000000085 | -0.512 | -0.93 | -1.252 |
| -0.530000000000085 | -0.508 | -0.923 | -1.244 |
| -0.525000000000085 | -0.503 | -0.916 | -1.236 |
| -0.520000000000085 | -0.499 | -0.909 | -1.228 |
| -0.515000000000085 | -0.495 | -0.902 | -1.219 |
| -0.510000000000085 | -0.49 | -0.895 | -1.211 |
| -0.505000000000085 | -0.486 | -0.888 | -1.203 |
| -0.500000000000085 | -0.481 | -0.881 | -1.195 |
| -0.495000000000085 | -0.477 | -0.874 | -1.186 |
| -0.490000000000085 | -0.472 | -0.867 | -1.178 |
| -0.485000000000085 | -0.468 | -0.86 | -1.17 |
| -0.480000000000085 | -0.463 | -0.853 | -1.161 |
| -0.475000000000085 | -0.459 | -0.846 | -1.152 |
| -0.470000000000085 | -0.454 | -0.838 | -1.144 |
| -0.465000000000085 | -0.45 | -0.831 | -1.135 |
| -0.460000000000085 | -0.445 | -0.824 | -1.126 |
| -0.455000000000085 | -0.441 | -0.816 | -1.117 |
| -0.450000000000085 | -0.436 | -0.809 | -1.109 |
| -0.445000000000085 | -0.431 | -0.801 | -1.1 |
| -0.440000000000085 | -0.427 | -0.794 | -1.091 |
| -0.435000000000085 | -0.422 | -0.786 | -1.081 |
| -0.430000000000085 | -0.418 | -0.779 | -1.072 |
| -0.425000000000085 | -0.413 | -0.771 | -1.063 |
| -0.420000000000085 | -0.409 | -0.764 | -1.054 |
| -0.415000000000085 | -0.404 | -0.756 | -1.044 |
| -0.410000000000085 | -0.399 | -0.748 | -1.035 |
| -0.405000000000085 | -0.395 | -0.74 | -1.026 |
| -0.400000000000085 | -0.39 | -0.733 | -1.016 |
| -0.395000000000085 | -0.385 | -0.725 | -1.006 |
| -0.390000000000085 | -0.381 | -0.717 | -0.997 |
| -0.385000000000085 | -0.376 | -0.709 | -0.987 |
| -0.380000000000085 | -0.371 | -0.701 | -0.977 |
| -0.375000000000085 | -0.367 | -0.693 | -0.967 |
| -0.370000000000085 | -0.362 | -0.685 | -0.957 |
| -0.365000000000085 | -0.357 | -0.677 | -0.947 |
| -0.360000000000085 | -0.353 | -0.669 | -0.937 |
| -0.355000000000085 | -0.348 | -0.661 | -0.927 |
| -0.350000000000085 | -0.343 | -0.653 | -0.916 |
| -0.345000000000085 | -0.338 | -0.644 | -0.906 |
| -0.340000000000085 | -0.334 | -0.636 | -0.895 |
| -0.335000000000085 | -0.329 | -0.628 | -0.885 |
| -0.330000000000085 | -0.324 | -0.62 | -0.874 |
| -0.325000000000085 | -0.32 | -0.611 | -0.864 |
| -0.320000000000085 | -0.315 | -0.603 | -0.853 |
| -0.315000000000085 | -0.31 | -0.594 | -0.842 |
| -0.310000000000085 | -0.305 | -0.586 | -0.831 |
| -0.305000000000085 | -0.3 | -0.577 | -0.82 |
| -0.300000000000085 | -0.296 | -0.569 | -0.809 |
| -0.295000000000085 | -0.291 | -0.56 | -0.798 |
| -0.290000000000085 | -0.286 | -0.552 | -0.786 |
| -0.285000000000085 | -0.281 | -0.543 | -0.775 |
| -0.280000000000085 | -0.276 | -0.534 | -0.764 |
| -0.275000000000085 | -0.272 | -0.525 | -0.752 |
| -0.270000000000085 | -0.267 | -0.517 | -0.74 |
| -0.265000000000085 | -0.262 | -0.508 | -0.729 |
| -0.260000000000085 | -0.257 | -0.499 | -0.717 |
| -0.255000000000085 | -0.252 | -0.49 | -0.705 |
| -0.250000000000085 | -0.247 | -0.481 | -0.693 |
| -0.245000000000085 | -0.243 | -0.472 | -0.681 |
| -0.240000000000085 | -0.238 | -0.463 | -0.669 |
| -0.235000000000085 | -0.233 | -0.454 | -0.657 |
| -0.230000000000085 | -0.228 | -0.445 | -0.644 |
| -0.225000000000085 | -0.223 | -0.436 | -0.632 |
| -0.220000000000085 | -0.218 | -0.427 | -0.62 |
| -0.215000000000085 | -0.213 | -0.418 | -0.607 |
| -0.210000000000085 | -0.208 | -0.409 | -0.594 |
| -0.205000000000085 | -0.204 | -0.399 | -0.582 |
| -0.200000000000085 | -0.199 | -0.39 | -0.569 |
| -0.195000000000085 | -0.194 | -0.381 | -0.556 |
| -0.190000000000085 | -0.189 | -0.371 | -0.543 |
| -0.185000000000085 | -0.184 | -0.362 | -0.53 |
| -0.180000000000085 | -0.179 | -0.353 | -0.517 |
| -0.175000000000085 | -0.174 | -0.343 | -0.503 |
| -0.170000000000085 | -0.169 | -0.334 | -0.49 |
| -0.165000000000085 | -0.164 | -0.324 | -0.477 |
| -0.160000000000085 | -0.159 | -0.315 | -0.463 |
| -0.155000000000084 | -0.154 | -0.305 | -0.45 |
| -0.150000000000084 | -0.149 | -0.296 | -0.436 |
| -0.145000000000084 | -0.144 | -0.286 | -0.422 |
| -0.140000000000084 | -0.14 | -0.276 | -0.409 |
| -0.135000000000084 | -0.135 | -0.267 | -0.395 |
| -0.130000000000084 | -0.13 | -0.257 | -0.381 |
| -0.125000000000084 | -0.125 | -0.247 | -0.367 |
| -0.120000000000084 | -0.12 | -0.238 | -0.353 |
| -0.115000000000084 | -0.115 | -0.228 | -0.338 |
| -0.110000000000084 | -0.11 | -0.218 | -0.324 |
| -0.105000000000084 | -0.105 | -0.208 | -0.31 |
| -0.100000000000084 | -0.1 | -0.199 | -0.296 |
| -0.0950000000000844 | -0.095 | -0.189 | -0.281 |
| -0.0900000000000844 | -0.09 | -0.179 | -0.267 |
| -0.0850000000000844 | -0.085 | -0.169 | -0.252 |
| -0.0800000000000844 | -0.08 | -0.159 | -0.238 |
| -0.0750000000000844 | -0.075 | -0.149 | -0.223 |
| -0.0700000000000844 | -0.07 | -0.14 | -0.208 |
| -0.0650000000000844 | -0.065 | -0.13 | -0.194 |
| -0.0600000000000844 | -0.06 | -0.12 | -0.179 |
| -0.0550000000000844 | -0.055 | -0.11 | -0.164 |
| -0.0500000000000844 | -0.05 | -0.1 | -0.149 |
| -0.0450000000000844 | -0.045 | -0.09 | -0.135 |
| -0.0400000000000844 | -0.04 | -0.08 | -0.12 |
| -0.0350000000000844 | -0.035 | -0.07 | -0.105 |
| -0.0300000000000844 | -0.03 | -0.06 | -0.09 |
| -0.0250000000000844 | -0.025 | -0.05 | -0.075 |
| -0.0200000000000844 | -0.02 | -0.04 | -0.06 |
| -0.0150000000000844 | -0.015 | -0.03 | -0.045 |
| -0.0100000000000844 | -0.01 | -0.02 | -0.03 |
| -0.00500000000008444 | -0.005 | -0.01 | -0.015 |
| -8.4444604087075e-14 | 0 | 0 | 0 |
| 0.00499999999991555 | 0.005 | 0.01 | 0.015 |
| 0.00999999999991555 | 0.01 | 0.02 | 0.03 |
| 0.0149999999999156 | 0.015 | 0.03 | 0.045 |
| 0.0199999999999156 | 0.02 | 0.04 | 0.06 |
| 0.0249999999999156 | 0.025 | 0.05 | 0.075 |
| 0.0299999999999156 | 0.03 | 0.06 | 0.09 |
| 0.0349999999999155 | 0.035 | 0.07 | 0.105 |
| 0.0399999999999155 | 0.04 | 0.08 | 0.12 |
| 0.0449999999999155 | 0.045 | 0.09 | 0.135 |
| 0.0499999999999155 | 0.05 | 0.1 | 0.149 |
| 0.0549999999999155 | 0.055 | 0.11 | 0.164 |
| 0.0599999999999155 | 0.06 | 0.12 | 0.179 |
| 0.0649999999999155 | 0.065 | 0.13 | 0.194 |
| 0.0699999999999155 | 0.07 | 0.14 | 0.208 |
| 0.0749999999999155 | 0.075 | 0.149 | 0.223 |
| 0.0799999999999155 | 0.08 | 0.159 | 0.238 |
| 0.0849999999999155 | 0.085 | 0.169 | 0.252 |
| 0.0899999999999155 | 0.09 | 0.179 | 0.267 |
| 0.0949999999999155 | 0.095 | 0.189 | 0.281 |
| 0.0999999999999155 | 0.1 | 0.199 | 0.296 |
| 0.104999999999916 | 0.105 | 0.208 | 0.31 |
| 0.109999999999916 | 0.11 | 0.218 | 0.324 |
| 0.114999999999916 | 0.115 | 0.228 | 0.338 |
| 0.119999999999916 | 0.12 | 0.238 | 0.353 |
| 0.124999999999916 | 0.125 | 0.247 | 0.367 |
| 0.129999999999916 | 0.13 | 0.257 | 0.381 |
| 0.134999999999916 | 0.135 | 0.267 | 0.395 |
| 0.139999999999916 | 0.14 | 0.276 | 0.409 |
| 0.144999999999916 | 0.144 | 0.286 | 0.422 |
| 0.149999999999916 | 0.149 | 0.296 | 0.436 |
| 0.154999999999916 | 0.154 | 0.305 | 0.45 |
| 0.159999999999916 | 0.159 | 0.315 | 0.463 |
| 0.164999999999916 | 0.164 | 0.324 | 0.477 |
| 0.169999999999916 | 0.169 | 0.334 | 0.49 |
| 0.174999999999916 | 0.174 | 0.343 | 0.503 |
| 0.179999999999916 | 0.179 | 0.353 | 0.517 |
| 0.184999999999916 | 0.184 | 0.362 | 0.53 |
| 0.189999999999916 | 0.189 | 0.371 | 0.543 |
| 0.194999999999916 | 0.194 | 0.381 | 0.556 |
| 0.199999999999916 | 0.199 | 0.39 | 0.569 |
| 0.204999999999916 | 0.204 | 0.399 | 0.582 |
| 0.209999999999916 | 0.208 | 0.409 | 0.594 |
| 0.214999999999916 | 0.213 | 0.418 | 0.607 |
| 0.219999999999916 | 0.218 | 0.427 | 0.62 |
| 0.224999999999916 | 0.223 | 0.436 | 0.632 |
| 0.229999999999916 | 0.228 | 0.445 | 0.644 |
| 0.234999999999916 | 0.233 | 0.454 | 0.657 |
| 0.239999999999916 | 0.238 | 0.463 | 0.669 |
| 0.244999999999916 | 0.243 | 0.472 | 0.681 |
| 0.249999999999916 | 0.247 | 0.481 | 0.693 |
| 0.254999999999916 | 0.252 | 0.49 | 0.705 |
| 0.259999999999916 | 0.257 | 0.499 | 0.717 |
| 0.264999999999916 | 0.262 | 0.508 | 0.729 |
| 0.269999999999916 | 0.267 | 0.517 | 0.74 |
| 0.274999999999916 | 0.272 | 0.525 | 0.752 |
| 0.279999999999916 | 0.276 | 0.534 | 0.764 |
| 0.284999999999916 | 0.281 | 0.543 | 0.775 |
| 0.289999999999916 | 0.286 | 0.552 | 0.786 |
| 0.294999999999916 | 0.291 | 0.56 | 0.798 |
| 0.299999999999916 | 0.296 | 0.569 | 0.809 |
| 0.304999999999916 | 0.3 | 0.577 | 0.82 |
| 0.309999999999916 | 0.305 | 0.586 | 0.831 |
| 0.314999999999916 | 0.31 | 0.594 | 0.842 |
| 0.319999999999916 | 0.315 | 0.603 | 0.853 |
| 0.324999999999916 | 0.32 | 0.611 | 0.864 |
| 0.329999999999916 | 0.324 | 0.62 | 0.874 |
| 0.334999999999916 | 0.329 | 0.628 | 0.885 |
| 0.339999999999916 | 0.334 | 0.636 | 0.895 |
| 0.344999999999916 | 0.338 | 0.644 | 0.906 |
| 0.349999999999916 | 0.343 | 0.653 | 0.916 |
| 0.354999999999916 | 0.348 | 0.661 | 0.927 |
| 0.359999999999916 | 0.353 | 0.669 | 0.937 |
| 0.364999999999916 | 0.357 | 0.677 | 0.947 |
| 0.369999999999916 | 0.362 | 0.685 | 0.957 |
| 0.374999999999916 | 0.367 | 0.693 | 0.967 |
| 0.379999999999916 | 0.371 | 0.701 | 0.977 |
| 0.384999999999916 | 0.376 | 0.709 | 0.987 |
| 0.389999999999916 | 0.381 | 0.717 | 0.997 |
| 0.394999999999916 | 0.385 | 0.725 | 1.006 |
| 0.399999999999916 | 0.39 | 0.733 | 1.016 |
| 0.404999999999916 | 0.395 | 0.74 | 1.026 |
| 0.409999999999916 | 0.399 | 0.748 | 1.035 |
| 0.414999999999916 | 0.404 | 0.756 | 1.044 |
| 0.419999999999916 | 0.409 | 0.764 | 1.054 |
| 0.424999999999916 | 0.413 | 0.771 | 1.063 |
| 0.429999999999916 | 0.418 | 0.779 | 1.072 |
| 0.434999999999916 | 0.422 | 0.786 | 1.081 |
| 0.439999999999916 | 0.427 | 0.794 | 1.091 |
| 0.444999999999916 | 0.431 | 0.801 | 1.1 |
| 0.449999999999916 | 0.436 | 0.809 | 1.109 |
| 0.454999999999916 | 0.441 | 0.816 | 1.117 |
| 0.459999999999916 | 0.445 | 0.824 | 1.126 |
| 0.464999999999916 | 0.45 | 0.831 | 1.135 |
| 0.469999999999916 | 0.454 | 0.838 | 1.144 |
| 0.474999999999916 | 0.459 | 0.846 | 1.152 |
| 0.479999999999916 | 0.463 | 0.853 | 1.161 |
| 0.484999999999916 | 0.468 | 0.86 | 1.17 |
| 0.489999999999916 | 0.472 | 0.867 | 1.178 |
| 0.494999999999916 | 0.477 | 0.874 | 1.186 |
| 0.499999999999916 | 0.481 | 0.881 | 1.195 |
| 0.504999999999916 | 0.486 | 0.888 | 1.203 |
| 0.509999999999916 | 0.49 | 0.895 | 1.211 |
| 0.514999999999916 | 0.495 | 0.902 | 1.219 |
| 0.519999999999916 | 0.499 | 0.909 | 1.228 |
| 0.524999999999916 | 0.503 | 0.916 | 1.236 |
| 0.529999999999916 | 0.508 | 0.923 | 1.244 |
| 0.534999999999916 | 0.512 | 0.93 | 1.252 |
| 0.539999999999916 | 0.517 | 0.937 | 1.26 |
| 0.544999999999916 | 0.521 | 0.944 | 1.267 |
| 0.549999999999916 | 0.525 | 0.95 | 1.275 |
| 0.554999999999916 | 0.53 | 0.957 | 1.283 |
| 0.559999999999916 | 0.534 | 0.964 | 1.291 |
| 0.564999999999916 | 0.539 | 0.97 | 1.298 |
| 0.569999999999916 | 0.543 | 0.977 | 1.306 |
| 0.574999999999916 | 0.547 | 0.984 | 1.313 |
| 0.579999999999916 | 0.552 | 0.99 | 1.321 |
| 0.584999999999916 | 0.556 | 0.997 | 1.328 |
| 0.589999999999916 | 0.56 | 1.003 | 1.336 |
| 0.594999999999916 | 0.565 | 1.01 | 1.343 |
| 0.599999999999916 | 0.569 | 1.016 | 1.35 |
| 0.604999999999916 | 0.573 | 1.022 | 1.358 |
| 0.609999999999916 | 0.577 | 1.029 | 1.365 |
| 0.614999999999916 | 0.582 | 1.035 | 1.372 |
| 0.619999999999916 | 0.586 | 1.041 | 1.379 |
| 0.624999999999916 | 0.59 | 1.048 | 1.386 |
| 0.629999999999916 | 0.594 | 1.054 | 1.393 |
| 0.634999999999916 | 0.599 | 1.06 | 1.4 |
| 0.639999999999916 | 0.603 | 1.066 | 1.407 |
| 0.644999999999916 | 0.607 | 1.072 | 1.414 |
| 0.649999999999916 | 0.611 | 1.078 | 1.421 |
| 0.654999999999916 | 0.615 | 1.085 | 1.428 |
| 0.659999999999916 | 0.62 | 1.091 | 1.435 |
| 0.664999999999916 | 0.624 | 1.097 | 1.441 |
| 0.669999999999916 | 0.628 | 1.103 | 1.448 |
| 0.674999999999916 | 0.632 | 1.109 | 1.455 |
| 0.679999999999916 | 0.636 | 1.115 | 1.461 |
| 0.684999999999916 | 0.64 | 1.12 | 1.468 |
| 0.689999999999916 | 0.644 | 1.126 | 1.475 |
| 0.694999999999916 | 0.649 | 1.132 | 1.481 |
| 0.699999999999916 | 0.653 | 1.138 | 1.487 |
| 0.704999999999916 | 0.657 | 1.144 | 1.494 |
| 0.709999999999916 | 0.661 | 1.15 | 1.5 |
| 0.714999999999916 | 0.665 | 1.155 | 1.507 |
| 0.719999999999916 | 0.669 | 1.161 | 1.513 |
| 0.724999999999916 | 0.673 | 1.167 | 1.519 |
| 0.729999999999916 | 0.677 | 1.172 | 1.526 |
| 0.734999999999916 | 0.681 | 1.178 | 1.532 |
| 0.739999999999916 | 0.685 | 1.184 | 1.538 |
| 0.744999999999916 | 0.689 | 1.189 | 1.544 |
| 0.749999999999916 | 0.693 | 1.195 | 1.55 |
| 0.754999999999916 | 0.697 | 1.2 | 1.556 |
| 0.759999999999916 | 0.701 | 1.206 | 1.562 |
| 0.764999999999916 | 0.705 | 1.211 | 1.568 |
| 0.769999999999916 | 0.709 | 1.217 | 1.574 |
| 0.774999999999916 | 0.713 | 1.222 | 1.58 |
| 0.779999999999916 | 0.717 | 1.228 | 1.586 |
| 0.784999999999916 | 0.721 | 1.233 | 1.592 |
| 0.789999999999916 | 0.725 | 1.238 | 1.598 |
| 0.794999999999916 | 0.729 | 1.244 | 1.604 |
| 0.799999999999916 | 0.733 | 1.249 | 1.609 |
| 0.804999999999916 | 0.737 | 1.254 | 1.615 |
| 0.809999999999916 | 0.74 | 1.26 | 1.621 |
| 0.814999999999916 | 0.744 | 1.265 | 1.627 |
| 0.819999999999916 | 0.748 | 1.27 | 1.632 |
| 0.824999999999916 | 0.752 | 1.275 | 1.638 |
| 0.829999999999916 | 0.756 | 1.28 | 1.644 |
| 0.834999999999916 | 0.76 | 1.286 | 1.649 |
| 0.839999999999916 | 0.764 | 1.291 | 1.655 |
| 0.844999999999916 | 0.767 | 1.296 | 1.66 |
| 0.849999999999916 | 0.771 | 1.301 | 1.666 |
| 0.854999999999916 | 0.775 | 1.306 | 1.671 |
| 0.859999999999916 | 0.779 | 1.311 | 1.677 |
| 0.864999999999916 | 0.783 | 1.316 | 1.682 |
| 0.869999999999916 | 0.786 | 1.321 | 1.687 |
| 0.874999999999916 | 0.79 | 1.326 | 1.693 |
| 0.879999999999916 | 0.794 | 1.331 | 1.698 |
| 0.884999999999916 | 0.798 | 1.336 | 1.703 |
| 0.889999999999916 | 0.801 | 1.341 | 1.709 |
| 0.894999999999916 | 0.805 | 1.346 | 1.714 |
| 0.899999999999916 | 0.809 | 1.35 | 1.719 |
| 0.904999999999916 | 0.813 | 1.355 | 1.724 |
| 0.909999999999916 | 0.816 | 1.36 | 1.729 |
| 0.914999999999916 | 0.82 | 1.365 | 1.735 |
| 0.919999999999916 | 0.824 | 1.37 | 1.74 |
| 0.924999999999916 | 0.827 | 1.374 | 1.745 |
| 0.929999999999916 | 0.831 | 1.379 | 1.75 |
| 0.934999999999916 | 0.835 | 1.384 | 1.755 |
| 0.939999999999916 | 0.838 | 1.389 | 1.76 |
| 0.944999999999916 | 0.842 | 1.393 | 1.765 |
| 0.949999999999916 | 0.846 | 1.398 | 1.77 |
| 0.954999999999916 | 0.849 | 1.403 | 1.775 |
| 0.959999999999916 | 0.853 | 1.407 | 1.78 |
| 0.964999999999916 | 0.856 | 1.412 | 1.785 |
| 0.969999999999916 | 0.86 | 1.416 | 1.79 |
| 0.974999999999916 | 0.864 | 1.421 | 1.794 |
| 0.979999999999916 | 0.867 | 1.426 | 1.799 |
| 0.984999999999916 | 0.871 | 1.43 | 1.804 |
| 0.989999999999916 | 0.874 | 1.435 | 1.809 |
| 0.994999999999916 | 0.878 | 1.439 | 1.814 |
| 0.999999999999916 | 0.881 | 1.444 | 1.818 |
| 1.004999999999916 | 0.885 | 1.448 | 1.823 |
| 1.009999999999916 | 0.888 | 1.453 | 1.828 |
| 1.014999999999916 | 0.892 | 1.457 | 1.833 |
| 1.019999999999916 | 0.895 | 1.461 | 1.837 |
| 1.024999999999916 | 0.899 | 1.466 | 1.842 |
| 1.029999999999916 | 0.902 | 1.47 | 1.847 |
| 1.034999999999916 | 0.906 | 1.475 | 1.851 |
| 1.039999999999915 | 0.909 | 1.479 | 1.856 |
| 1.044999999999915 | 0.913 | 1.483 | 1.86 |
| 1.049999999999915 | 0.916 | 1.487 | 1.865 |
| 1.054999999999915 | 0.92 | 1.492 | 1.869 |
| 1.059999999999915 | 0.923 | 1.496 | 1.874 |
| 1.064999999999915 | 0.927 | 1.5 | 1.878 |
| 1.069999999999915 | 0.93 | 1.505 | 1.883 |
| 1.074999999999915 | 0.933 | 1.509 | 1.887 |
| 1.079999999999915 | 0.937 | 1.513 | 1.892 |
| 1.084999999999914 | 0.94 | 1.517 | 1.896 |
| 1.089999999999914 | 0.944 | 1.521 | 1.901 |
| 1.094999999999914 | 0.947 | 1.526 | 1.905 |
| 1.099999999999914 | 0.95 | 1.53 | 1.909 |
| 1.104999999999914 | 0.954 | 1.534 | 1.914 |
| 1.109999999999914 | 0.957 | 1.538 | 1.918 |
| 1.114999999999914 | 0.96 | 1.542 | 1.922 |
| 1.119999999999914 | 0.964 | 1.546 | 1.927 |
| 1.124999999999914 | 0.967 | 1.55 | 1.931 |
| 1.129999999999914 | 0.97 | 1.554 | 1.935 |
| 1.134999999999913 | 0.974 | 1.558 | 1.939 |
| 1.139999999999913 | 0.977 | 1.562 | 1.944 |
| 1.144999999999913 | 0.98 | 1.566 | 1.948 |
| 1.149999999999913 | 0.984 | 1.57 | 1.952 |
| 1.154999999999913 | 0.987 | 1.574 | 1.956 |
| 1.159999999999913 | 0.99 | 1.578 | 1.96 |
| 1.164999999999913 | 0.993 | 1.582 | 1.964 |
| 1.169999999999913 | 0.997 | 1.586 | 1.968 |
| 1.174999999999913 | 1 | 1.59 | 1.973 |
| 1.179999999999912 | 1.003 | 1.594 | 1.977 |
| 1.184999999999912 | 1.006 | 1.598 | 1.981 |
| 1.189999999999912 | 1.01 | 1.602 | 1.985 |
| 1.194999999999912 | 1.013 | 1.606 | 1.989 |
| 1.199999999999912 | 1.016 | 1.609 | 1.993 |
| 1.204999999999912 | 1.019 | 1.613 | 1.997 |
| 1.209999999999912 | 1.022 | 1.617 | 2.001 |
| 1.214999999999912 | 1.026 | 1.621 | 2.005 |
| 1.219999999999912 | 1.029 | 1.625 | 2.009 |
| 1.224999999999911 | 1.032 | 1.628 | 2.013 |
| 1.229999999999911 | 1.035 | 1.632 | 2.017 |
| 1.234999999999911 | 1.038 | 1.636 | 2.021 |
| 1.239999999999911 | 1.041 | 1.64 | 2.024 |
| 1.244999999999911 | 1.044 | 1.644 | 2.028 |
| 1.249999999999911 | 1.048 | 1.647 | 2.032 |
| 1.254999999999911 | 1.051 | 1.651 | 2.036 |
| 1.259999999999911 | 1.054 | 1.655 | 2.04 |
| 1.264999999999911 | 1.057 | 1.658 | 2.044 |
| 1.269999999999911 | 1.06 | 1.662 | 2.048 |
| 1.27499999999991 | 1.063 | 1.666 | 2.051 |
| 1.27999999999991 | 1.066 | 1.669 | 2.055 |
| 1.28499999999991 | 1.069 | 1.673 | 2.059 |
| 1.28999999999991 | 1.072 | 1.677 | 2.063 |
| 1.29499999999991 | 1.075 | 1.68 | 2.066 |
| 1.29999999999991 | 1.078 | 1.684 | 2.07 |
| 1.30499999999991 | 1.081 | 1.687 | 2.074 |
| 1.30999999999991 | 1.085 | 1.691 | 2.078 |
| 1.31499999999991 | 1.088 | 1.694 | 2.081 |
| 1.319999999999909 | 1.091 | 1.698 | 2.085 |
| 1.324999999999909 | 1.094 | 1.702 | 2.089 |
| 1.329999999999909 | 1.097 | 1.705 | 2.092 |
| 1.334999999999909 | 1.1 | 1.709 | 2.096 |
| 1.339999999999909 | 1.103 | 1.712 | 2.1 |
| 1.344999999999909 | 1.106 | 1.716 | 2.103 |
| 1.349999999999909 | 1.109 | 1.719 | 2.107 |
| 1.354999999999909 | 1.112 | 1.723 | 2.11 |
| 1.359999999999909 | 1.115 | 1.726 | 2.114 |
| 1.364999999999908 | 1.117 | 1.729 | 2.117 |
| 1.369999999999908 | 1.12 | 1.733 | 2.121 |
| 1.374999999999908 | 1.123 | 1.736 | 2.125 |
| 1.379999999999908 | 1.126 | 1.74 | 2.128 |
| 1.384999999999908 | 1.129 | 1.743 | 2.132 |
| 1.389999999999908 | 1.132 | 1.746 | 2.135 |
| 1.394999999999908 | 1.135 | 1.75 | 2.139 |
| 1.399999999999908 | 1.138 | 1.753 | 2.142 |
| 1.404999999999908 | 1.141 | 1.757 | 2.146 |
| 1.409999999999908 | 1.144 | 1.76 | 2.149 |
| 1.414999999999907 | 1.147 | 1.763 | 2.152 |
| 1.419999999999907 | 1.15 | 1.767 | 2.156 |
| 1.424999999999907 | 1.152 | 1.77 | 2.159 |
| 1.429999999999907 | 1.155 | 1.773 | 2.163 |
| 1.434999999999907 | 1.158 | 1.777 | 2.166 |
| 1.439999999999907 | 1.161 | 1.78 | 2.17 |
| 1.444999999999907 | 1.164 | 1.783 | 2.173 |
| 1.449999999999907 | 1.167 | 1.786 | 2.176 |
| 1.454999999999907 | 1.17 | 1.79 | 2.18 |
| 1.459999999999906 | 1.172 | 1.793 | 2.183 |
| 1.464999999999906 | 1.175 | 1.796 | 2.186 |
| 1.469999999999906 | 1.178 | 1.799 | 2.19 |
| 1.474999999999906 | 1.181 | 1.803 | 2.193 |
| 1.479999999999906 | 1.184 | 1.806 | 2.196 |
| 1.484999999999906 | 1.186 | 1.809 | 2.2 |
| 1.489999999999906 | 1.189 | 1.812 | 2.203 |
| 1.494999999999906 | 1.192 | 1.815 | 2.206 |
| 1.499999999999906 | 1.195 | 1.818 | 2.209 |
| 1.504999999999906 | 1.198 | 1.822 | 2.213 |
| 1.509999999999905 | 1.2 | 1.825 | 2.216 |
| 1.514999999999905 | 1.203 | 1.828 | 2.219 |
| 1.519999999999905 | 1.206 | 1.831 | 2.222 |
| 1.524999999999905 | 1.209 | 1.834 | 2.225 |
| 1.529999999999905 | 1.211 | 1.837 | 2.229 |
| 1.534999999999905 | 1.214 | 1.84 | 2.232 |
| 1.539999999999905 | 1.217 | 1.843 | 2.235 |
| 1.544999999999905 | 1.219 | 1.847 | 2.238 |
| 1.549999999999905 | 1.222 | 1.85 | 2.241 |
| 1.554999999999904 | 1.225 | 1.853 | 2.245 |
| 1.559999999999904 | 1.228 | 1.856 | 2.248 |
| 1.564999999999904 | 1.23 | 1.859 | 2.251 |
| 1.569999999999904 | 1.233 | 1.862 | 2.254 |
| 1.574999999999904 | 1.236 | 1.865 | 2.257 |
| 1.579999999999904 | 1.238 | 1.868 | 2.26 |
| 1.584999999999904 | 1.241 | 1.871 | 2.263 |
| 1.589999999999904 | 1.244 | 1.874 | 2.266 |
| 1.594999999999904 | 1.246 | 1.877 | 2.269 |
| 1.599999999999903 | 1.249 | 1.88 | 2.272 |
| 1.604999999999903 | 1.252 | 1.883 | 2.275 |
| 1.609999999999903 | 1.254 | 1.886 | 2.279 |
| 1.614999999999903 | 1.257 | 1.889 | 2.282 |
| 1.619999999999903 | 1.26 | 1.892 | 2.285 |
| 1.624999999999903 | 1.262 | 1.895 | 2.288 |
| 1.629999999999903 | 1.265 | 1.898 | 2.291 |
| 1.634999999999903 | 1.267 | 1.901 | 2.294 |
| 1.639999999999903 | 1.27 | 1.903 | 2.297 |
| 1.644999999999902 | 1.273 | 1.906 | 2.3 |
| 1.649999999999902 | 1.275 | 1.909 | 2.303 |
| 1.654999999999902 | 1.278 | 1.912 | 2.306 |
| 1.659999999999902 | 1.28 | 1.915 | 2.309 |
| 1.664999999999902 | 1.283 | 1.918 | 2.311 |
| 1.669999999999902 | 1.286 | 1.921 | 2.314 |
| 1.674999999999902 | 1.288 | 1.924 | 2.317 |
| 1.679999999999902 | 1.291 | 1.927 | 2.32 |
| 1.684999999999902 | 1.293 | 1.929 | 2.323 |
| 1.689999999999901 | 1.296 | 1.932 | 2.326 |
| 1.694999999999901 | 1.298 | 1.935 | 2.329 |
| 1.699999999999901 | 1.301 | 1.938 | 2.332 |
| 1.704999999999901 | 1.303 | 1.941 | 2.335 |
| 1.709999999999901 | 1.306 | 1.944 | 2.338 |
| 1.714999999999901 | 1.308 | 1.946 | 2.34 |
| 1.719999999999901 | 1.311 | 1.949 | 2.343 |
| 1.724999999999901 | 1.313 | 1.952 | 2.346 |
| 1.729999999999901 | 1.316 | 1.955 | 2.349 |
| 1.734999999999901 | 1.318 | 1.957 | 2.352 |
| 1.7399999999999 | 1.321 | 1.96 | 2.355 |
| 1.7449999999999 | 1.323 | 1.963 | 2.358 |
| 1.7499999999999 | 1.326 | 1.966 | 2.36 |
| 1.7549999999999 | 1.328 | 1.968 | 2.363 |
| 1.7599999999999 | 1.331 | 1.971 | 2.366 |
| 1.7649999999999 | 1.333 | 1.974 | 2.369 |
| 1.7699999999999 | 1.336 | 1.977 | 2.371 |
| 1.7749999999999 | 1.338 | 1.979 | 2.374 |
| 1.7799999999999 | 1.341 | 1.982 | 2.377 |
| 1.784999999999899 | 1.343 | 1.985 | 2.38 |
| 1.789999999999899 | 1.346 | 1.987 | 2.383 |
| 1.794999999999899 | 1.348 | 1.99 | 2.385 |
| 1.799999999999899 | 1.35 | 1.993 | 2.388 |
| 1.804999999999899 | 1.353 | 1.996 | 2.391 |
| 1.809999999999899 | 1.355 | 1.998 | 2.393 |
| 1.814999999999899 | 1.358 | 2.001 | 2.396 |
| 1.819999999999899 | 1.36 | 2.003 | 2.399 |
| 1.824999999999899 | 1.363 | 2.006 | 2.402 |
| 1.829999999999899 | 1.365 | 2.009 | 2.404 |
| 1.834999999999898 | 1.367 | 2.011 | 2.407 |
| 1.839999999999898 | 1.37 | 2.014 | 2.41 |
| 1.844999999999898 | 1.372 | 2.017 | 2.412 |
| 1.849999999999898 | 1.374 | 2.019 | 2.415 |
| 1.854999999999898 | 1.377 | 2.022 | 2.418 |
| 1.859999999999898 | 1.379 | 2.024 | 2.42 |
| 1.864999999999898 | 1.382 | 2.027 | 2.423 |
| 1.869999999999898 | 1.384 | 2.03 | 2.426 |
| 1.874999999999898 | 1.386 | 2.032 | 2.428 |
| 1.879999999999897 | 1.389 | 2.035 | 2.431 |
| 1.884999999999897 | 1.391 | 2.037 | 2.433 |
| 1.889999999999897 | 1.393 | 2.04 | 2.436 |
| 1.894999999999897 | 1.396 | 2.042 | 2.439 |
| 1.899999999999897 | 1.398 | 2.045 | 2.441 |
| 1.904999999999897 | 1.4 | 2.048 | 2.444 |
| 1.909999999999897 | 1.403 | 2.05 | 2.446 |
| 1.914999999999897 | 1.405 | 2.053 | 2.449 |
| 1.919999999999897 | 1.407 | 2.055 | 2.452 |
| 1.924999999999897 | 1.41 | 2.058 | 2.454 |
| 1.929999999999896 | 1.412 | 2.06 | 2.457 |
| 1.934999999999896 | 1.414 | 2.063 | 2.459 |
| 1.939999999999896 | 1.416 | 2.065 | 2.462 |
| 1.944999999999896 | 1.419 | 2.068 | 2.464 |
| 1.949999999999896 | 1.421 | 2.07 | 2.467 |
| 1.954999999999896 | 1.423 | 2.073 | 2.469 |
| 1.959999999999896 | 1.426 | 2.075 | 2.472 |
| 1.964999999999896 | 1.428 | 2.078 | 2.474 |
| 1.969999999999896 | 1.43 | 2.08 | 2.477 |
| 1.974999999999895 | 1.432 | 2.083 | 2.479 |
| 1.979999999999895 | 1.435 | 2.085 | 2.482 |
| 1.984999999999895 | 1.437 | 2.087 | 2.484 |
| 1.989999999999895 | 1.439 | 2.09 | 2.487 |
| 1.994999999999895 | 1.441 | 2.092 | 2.489 |
| 1.999999999999895 | 1.444 | 2.095 | 2.492 |
| 2.004999999999895 | 1.446 | 2.097 | 2.494 |
| 2.009999999999895 | 1.448 | 2.1 | 2.497 |
| 2.014999999999895 | 1.45 | 2.102 | 2.499 |
| 2.019999999999895 | 1.453 | 2.104 | 2.502 |
| 2.024999999999895 | 1.455 | 2.107 | 2.504 |
| 2.029999999999895 | 1.457 | 2.109 | 2.506 |
| 2.034999999999894 | 1.459 | 2.112 | 2.509 |
| 2.039999999999894 | 1.461 | 2.114 | 2.511 |
| 2.044999999999894 | 1.464 | 2.116 | 2.514 |
| 2.049999999999894 | 1.466 | 2.119 | 2.516 |
| 2.054999999999894 | 1.468 | 2.121 | 2.519 |
| 2.059999999999894 | 1.47 | 2.123 | 2.521 |
| 2.064999999999894 | 1.472 | 2.126 | 2.523 |
| 2.069999999999894 | 1.475 | 2.128 | 2.526 |
| 2.074999999999894 | 1.477 | 2.13 | 2.528 |
| 2.079999999999893 | 1.479 | 2.133 | 2.53 |
| 2.084999999999893 | 1.481 | 2.135 | 2.533 |
| 2.089999999999893 | 1.483 | 2.137 | 2.535 |
| 2.094999999999893 | 1.485 | 2.14 | 2.538 |
| 2.099999999999893 | 1.487 | 2.142 | 2.54 |
| 2.104999999999893 | 1.49 | 2.144 | 2.542 |
| 2.109999999999893 | 1.492 | 2.147 | 2.545 |
| 2.114999999999893 | 1.494 | 2.149 | 2.547 |
| 2.119999999999893 | 1.496 | 2.151 | 2.549 |
| 2.124999999999893 | 1.498 | 2.154 | 2.552 |
| 2.129999999999892 | 1.5 | 2.156 | 2.554 |
| 2.134999999999892 | 1.502 | 2.158 | 2.556 |
| 2.139999999999892 | 1.505 | 2.16 | 2.559 |
| 2.144999999999892 | 1.507 | 2.163 | 2.561 |
| 2.149999999999892 | 1.509 | 2.165 | 2.563 |
| 2.154999999999892 | 1.511 | 2.167 | 2.565 |
| 2.159999999999892 | 1.513 | 2.17 | 2.568 |
| 2.164999999999892 | 1.515 | 2.172 | 2.57 |
| 2.169999999999892 | 1.517 | 2.174 | 2.572 |
| 2.174999999999891 | 1.519 | 2.176 | 2.575 |
| 2.179999999999891 | 1.521 | 2.179 | 2.577 |
| 2.184999999999891 | 1.523 | 2.181 | 2.579 |
| 2.189999999999891 | 1.526 | 2.183 | 2.581 |
| 2.194999999999891 | 1.528 | 2.185 | 2.584 |
| 2.199999999999891 | 1.53 | 2.187 | 2.586 |
| 2.204999999999891 | 1.532 | 2.19 | 2.588 |
| 2.209999999999891 | 1.534 | 2.192 | 2.59 |
| 2.214999999999891 | 1.536 | 2.194 | 2.593 |
| 2.21999999999989 | 1.538 | 2.196 | 2.595 |
| 2.22499999999989 | 1.54 | 2.198 | 2.597 |
| 2.22999999999989 | 1.542 | 2.201 | 2.599 |
| 2.23499999999989 | 1.544 | 2.203 | 2.602 |
| 2.23999999999989 | 1.546 | 2.205 | 2.604 |
| 2.24499999999989 | 1.548 | 2.207 | 2.606 |
| 2.24999999999989 | 1.55 | 2.209 | 2.608 |
| 2.25499999999989 | 1.552 | 2.212 | 2.61 |
| 2.25999999999989 | 1.554 | 2.214 | 2.613 |
| 2.26499999999989 | 1.556 | 2.216 | 2.615 |
| 2.269999999999889 | 1.558 | 2.218 | 2.617 |
| 2.274999999999889 | 1.56 | 2.22 | 2.619 |
| 2.279999999999889 | 1.562 | 2.222 | 2.621 |
| 2.284999999999889 | 1.564 | 2.224 | 2.623 |
| 2.289999999999889 | 1.566 | 2.227 | 2.626 |
| 2.294999999999889 | 1.568 | 2.229 | 2.628 |
| 2.299999999999889 | 1.57 | 2.231 | 2.63 |
| 2.304999999999889 | 1.572 | 2.233 | 2.632 |
| 2.309999999999889 | 1.574 | 2.235 | 2.634 |
| 2.314999999999888 | 1.576 | 2.237 | 2.636 |
| 2.319999999999888 | 1.578 | 2.239 | 2.638 |
| 2.324999999999888 | 1.58 | 2.241 | 2.641 |
| 2.329999999999888 | 1.582 | 2.243 | 2.643 |
| 2.334999999999888 | 1.584 | 2.246 | 2.645 |
| 2.339999999999888 | 1.586 | 2.248 | 2.647 |
| 2.344999999999888 | 1.588 | 2.25 | 2.649 |
| 2.349999999999888 | 1.59 | 2.252 | 2.651 |
| 2.354999999999888 | 1.592 | 2.254 | 2.653 |
| 2.359999999999887 | 1.594 | 2.256 | 2.655 |
| 2.364999999999887 | 1.596 | 2.258 | 2.657 |
| 2.369999999999887 | 1.598 | 2.26 | 2.66 |
| 2.374999999999887 | 1.6 | 2.262 | 2.662 |
| 2.379999999999887 | 1.602 | 2.264 | 2.664 |
| 2.384999999999887 | 1.604 | 2.266 | 2.666 |
| 2.389999999999887 | 1.606 | 2.268 | 2.668 |
| 2.394999999999887 | 1.608 | 2.27 | 2.67 |
| 2.399999999999887 | 1.609 | 2.272 | 2.672 |
| 2.404999999999887 | 1.611 | 2.274 | 2.674 |
| 2.409999999999886 | 1.613 | 2.277 | 2.676 |
| 2.414999999999886 | 1.615 | 2.279 | 2.678 |
| 2.419999999999886 | 1.617 | 2.281 | 2.68 |
| 2.424999999999886 | 1.619 | 2.283 | 2.682 |
| 2.429999999999886 | 1.621 | 2.285 | 2.684 |
| 2.434999999999886 | 1.623 | 2.287 | 2.686 |
| 2.439999999999886 | 1.625 | 2.289 | 2.688 |
| 2.444999999999886 | 1.627 | 2.291 | 2.69 |
| 2.449999999999886 | 1.628 | 2.293 | 2.692 |
| 2.454999999999885 | 1.63 | 2.295 | 2.694 |
| 2.459999999999885 | 1.632 | 2.297 | 2.696 |
| 2.464999999999885 | 1.634 | 2.299 | 2.698 |
| 2.469999999999885 | 1.636 | 2.301 | 2.7 |
| 2.474999999999885 | 1.638 | 2.303 | 2.703 |
| 2.479999999999885 | 1.64 | 2.305 | 2.705 |
| 2.484999999999885 | 1.642 | 2.307 | 2.707 |
| 2.489999999999885 | 1.644 | 2.309 | 2.708 |
| 2.494999999999885 | 1.645 | 2.31 | 2.71 |
| 2.499999999999884 | 1.647 | 2.312 | 2.712 |
| 2.504999999999884 | 1.649 | 2.314 | 2.714 |
| 2.509999999999884 | 1.651 | 2.316 | 2.716 |
| 2.514999999999884 | 1.653 | 2.318 | 2.718 |
| 2.519999999999884 | 1.655 | 2.32 | 2.72 |
| 2.524999999999884 | 1.656 | 2.322 | 2.722 |
| 2.529999999999884 | 1.658 | 2.324 | 2.724 |
| 2.534999999999884 | 1.66 | 2.326 | 2.726 |
| 2.539999999999884 | 1.662 | 2.328 | 2.728 |
| 2.544999999999884 | 1.664 | 2.33 | 2.73 |
| 2.549999999999883 | 1.666 | 2.332 | 2.732 |
| 2.554999999999883 | 1.667 | 2.334 | 2.734 |
| 2.559999999999883 | 1.669 | 2.336 | 2.736 |
| 2.564999999999883 | 1.671 | 2.338 | 2.738 |
| 2.569999999999883 | 1.673 | 2.34 | 2.74 |
| 2.574999999999883 | 1.675 | 2.341 | 2.742 |
| 2.579999999999883 | 1.677 | 2.343 | 2.744 |
| 2.584999999999883 | 1.678 | 2.345 | 2.746 |
| 2.589999999999883 | 1.68 | 2.347 | 2.748 |
| 2.594999999999882 | 1.682 | 2.349 | 2.749 |
| 2.599999999999882 | 1.684 | 2.351 | 2.751 |
| 2.604999999999882 | 1.686 | 2.353 | 2.753 |
| 2.609999999999882 | 1.687 | 2.355 | 2.755 |
| 2.614999999999882 | 1.689 | 2.357 | 2.757 |
| 2.619999999999882 | 1.691 | 2.358 | 2.759 |
| 2.624999999999882 | 1.693 | 2.36 | 2.761 |
| 2.629999999999882 | 1.694 | 2.362 | 2.763 |
| 2.634999999999882 | 1.696 | 2.364 | 2.765 |
| 2.639999999999881 | 1.698 | 2.366 | 2.767 |
| 2.644999999999881 | 1.7 | 2.368 | 2.768 |
| 2.649999999999881 | 1.702 | 2.37 | 2.77 |
| 2.654999999999881 | 1.703 | 2.371 | 2.772 |
| 2.659999999999881 | 1.705 | 2.373 | 2.774 |
| 2.664999999999881 | 1.707 | 2.375 | 2.776 |
| 2.669999999999881 | 1.709 | 2.377 | 2.778 |
| 2.674999999999881 | 1.71 | 2.379 | 2.78 |
| 2.679999999999881 | 1.712 | 2.381 | 2.781 |
| 2.68499999999988 | 1.714 | 2.383 | 2.783 |
| 2.68999999999988 | 1.716 | 2.384 | 2.785 |
| 2.69499999999988 | 1.717 | 2.386 | 2.787 |
| 2.69999999999988 | 1.719 | 2.388 | 2.789 |
| 2.70499999999988 | 1.721 | 2.39 | 2.791 |
| 2.70999999999988 | 1.723 | 2.392 | 2.792 |
| 2.71499999999988 | 1.724 | 2.393 | 2.794 |
| 2.71999999999988 | 1.726 | 2.395 | 2.796 |
| 2.72499999999988 | 1.728 | 2.397 | 2.798 |
| 2.72999999999988 | 1.729 | 2.399 | 2.8 |
| 2.734999999999879 | 1.731 | 2.401 | 2.802 |
| 2.739999999999879 | 1.733 | 2.402 | 2.803 |
| 2.744999999999879 | 1.735 | 2.404 | 2.805 |
| 2.749999999999879 | 1.736 | 2.406 | 2.807 |
| 2.754999999999879 | 1.738 | 2.408 | 2.809 |
| 2.759999999999879 | 1.74 | 2.41 | 2.811 |
| 2.764999999999879 | 1.741 | 2.411 | 2.812 |
| 2.769999999999879 | 1.743 | 2.413 | 2.814 |
| 2.774999999999879 | 1.745 | 2.415 | 2.816 |
| 2.779999999999878 | 1.746 | 2.417 | 2.818 |
| 2.784999999999878 | 1.748 | 2.419 | 2.82 |
| 2.789999999999878 | 1.75 | 2.42 | 2.821 |
| 2.794999999999878 | 1.752 | 2.422 | 2.823 |
| 2.799999999999878 | 1.753 | 2.424 | 2.825 |
| 2.804999999999878 | 1.755 | 2.426 | 2.827 |
| 2.809999999999878 | 1.757 | 2.427 | 2.828 |
| 2.814999999999878 | 1.758 | 2.429 | 2.83 |
| 2.819999999999878 | 1.76 | 2.431 | 2.832 |
| 2.824999999999878 | 1.762 | 2.433 | 2.834 |
| 2.829999999999877 | 1.763 | 2.434 | 2.835 |
| 2.834999999999877 | 1.765 | 2.436 | 2.837 |
| 2.839999999999877 | 1.767 | 2.438 | 2.839 |
| 2.844999999999877 | 1.768 | 2.439 | 2.841 |
| 2.849999999999877 | 1.77 | 2.441 | 2.842 |
| 2.854999999999877 | 1.772 | 2.443 | 2.844 |
| 2.859999999999877 | 1.773 | 2.445 | 2.846 |
| 2.864999999999877 | 1.775 | 2.446 | 2.848 |
| 2.869999999999877 | 1.777 | 2.448 | 2.849 |
| 2.874999999999876 | 1.778 | 2.45 | 2.851 |
| 2.879999999999876 | 1.78 | 2.452 | 2.853 |
| 2.884999999999876 | 1.781 | 2.453 | 2.855 |
| 2.889999999999876 | 1.783 | 2.455 | 2.856 |
| 2.894999999999876 | 1.785 | 2.457 | 2.858 |
| 2.899999999999876 | 1.786 | 2.458 | 2.86 |
| 2.904999999999876 | 1.788 | 2.46 | 2.861 |
| 2.909999999999876 | 1.79 | 2.462 | 2.863 |
| 2.914999999999876 | 1.791 | 2.463 | 2.865 |
| 2.919999999999876 | 1.793 | 2.465 | 2.867 |
| 2.924999999999875 | 1.794 | 2.467 | 2.868 |
| 2.929999999999875 | 1.796 | 2.468 | 2.87 |
| 2.934999999999875 | 1.798 | 2.47 | 2.872 |
| 2.939999999999875 | 1.799 | 2.472 | 2.873 |
| 2.944999999999875 | 1.801 | 2.474 | 2.875 |
| 2.949999999999875 | 1.803 | 2.475 | 2.877 |
| 2.954999999999875 | 1.804 | 2.477 | 2.878 |
| 2.959999999999875 | 1.806 | 2.479 | 2.88 |
| 2.964999999999875 | 1.807 | 2.48 | 2.882 |
| 2.969999999999874 | 1.809 | 2.482 | 2.883 |
| 2.974999999999874 | 1.811 | 2.484 | 2.885 |
| 2.979999999999874 | 1.812 | 2.485 | 2.887 |
| 2.984999999999874 | 1.814 | 2.487 | 2.888 |
| 2.989999999999874 | 1.815 | 2.488 | 2.89 |
| 2.994999999999874 | 1.817 | 2.49 | 2.892 |
| 2.999999999999874 | 1.818 | 2.492 | 2.893 |
| 3.004999999999874 | 1.82 | 2.493 | 2.895 |
| 3.009999999999874 | 1.822 | 2.495 | 2.897 |
| 3.014999999999874 | 1.823 | 2.497 | 2.898 |
| 3.019999999999873 | 1.825 | 2.498 | 2.9 |
| 3.024999999999873 | 1.826 | 2.5 | 2.902 |
| 3.029999999999873 | 1.828 | 2.502 | 2.903 |
| 3.034999999999873 | 1.829 | 2.503 | 2.905 |
| 3.039999999999873 | 1.831 | 2.505 | 2.907 |
| 3.044999999999873 | 1.833 | 2.506 | 2.908 |
| 3.049999999999873 | 1.834 | 2.508 | 2.91 |
| 3.054999999999873 | 1.836 | 2.51 | 2.912 |
| 3.059999999999873 | 1.837 | 2.511 | 2.913 |
| 3.064999999999872 | 1.839 | 2.513 | 2.915 |
| 3.069999999999872 | 1.84 | 2.515 | 2.916 |
| 3.074999999999872 | 1.842 | 2.516 | 2.918 |
| 3.079999999999872 | 1.843 | 2.518 | 2.92 |
| 3.084999999999872 | 1.845 | 2.519 | 2.921 |
| 3.089999999999872 | 1.847 | 2.521 | 2.923 |
| 3.094999999999872 | 1.848 | 2.523 | 2.924 |
| 3.099999999999872 | 1.85 | 2.524 | 2.926 |
| 3.104999999999872 | 1.851 | 2.526 | 2.928 |
| 3.109999999999872 | 1.853 | 2.527 | 2.929 |
| 3.114999999999871 | 1.854 | 2.529 | 2.931 |
| 3.119999999999871 | 1.856 | 2.53 | 2.932 |
| 3.124999999999871 | 1.857 | 2.532 | 2.934 |
| 3.129999999999871 | 1.859 | 2.534 | 2.936 |
| 3.134999999999871 | 1.86 | 2.535 | 2.937 |
| 3.139999999999871 | 1.862 | 2.537 | 2.939 |
| 3.144999999999871 | 1.863 | 2.538 | 2.94 |
| 3.149999999999871 | 1.865 | 2.54 | 2.942 |
| 3.154999999999871 | 1.866 | 2.542 | 2.944 |
| 3.15999999999987 | 1.868 | 2.543 | 2.945 |
| 3.16499999999987 | 1.869 | 2.545 | 2.947 |
| 3.16999999999987 | 1.871 | 2.546 | 2.948 |
| 3.17499999999987 | 1.872 | 2.548 | 2.95 |
| 3.17999999999987 | 1.874 | 2.549 | 2.951 |
| 3.18499999999987 | 1.875 | 2.551 | 2.953 |
| 3.18999999999987 | 1.877 | 2.552 | 2.954 |
| 3.19499999999987 | 1.878 | 2.554 | 2.956 |
| 3.19999999999987 | 1.88 | 2.555 | 2.958 |
| 3.204999999999869 | 1.881 | 2.557 | 2.959 |
| 3.209999999999869 | 1.883 | 2.559 | 2.961 |
| 3.214999999999869 | 1.884 | 2.56 | 2.962 |
| 3.219999999999869 | 1.886 | 2.562 | 2.964 |
| 3.224999999999869 | 1.887 | 2.563 | 2.965 |
| 3.229999999999869 | 1.889 | 2.565 | 2.967 |
| 3.234999999999869 | 1.89 | 2.566 | 2.968 |
| 3.239999999999869 | 1.892 | 2.568 | 2.97 |
| 3.244999999999869 | 1.893 | 2.569 | 2.972 |
| 3.249999999999869 | 1.895 | 2.571 | 2.973 |
| 3.254999999999868 | 1.896 | 2.572 | 2.975 |
| 3.259999999999868 | 1.898 | 2.574 | 2.976 |
| 3.264999999999868 | 1.899 | 2.575 | 2.978 |
| 3.269999999999868 | 1.901 | 2.577 | 2.979 |
| 3.274999999999868 | 1.902 | 2.578 | 2.981 |
| 3.279999999999868 | 1.903 | 2.58 | 2.982 |
| 3.284999999999868 | 1.905 | 2.581 | 2.984 |
| 3.289999999999868 | 1.906 | 2.583 | 2.985 |
| 3.294999999999868 | 1.908 | 2.584 | 2.987 |
| 3.299999999999867 | 1.909 | 2.586 | 2.988 |
| 3.304999999999867 | 1.911 | 2.587 | 2.99 |
| 3.309999999999867 | 1.912 | 2.589 | 2.991 |
| 3.314999999999867 | 1.914 | 2.59 | 2.993 |
| 3.319999999999867 | 1.915 | 2.592 | 2.994 |
| 3.324999999999867 | 1.916 | 2.593 | 2.996 |
| 3.329999999999867 | 1.918 | 2.595 | 2.997 |
| 3.334999999999867 | 1.919 | 2.596 | 2.999 |
| 3.339999999999867 | 1.921 | 2.598 | 3 |
| 3.344999999999866 | 1.922 | 2.599 | 3.002 |
| 3.349999999999866 | 1.924 | 2.601 | 3.003 |
| 3.354999999999866 | 1.925 | 2.602 | 3.005 |
| 3.359999999999866 | 1.927 | 2.604 | 3.006 |
| 3.364999999999866 | 1.928 | 2.605 | 3.008 |
| 3.369999999999866 | 1.929 | 2.607 | 3.009 |
| 3.374999999999866 | 1.931 | 2.608 | 3.011 |
| 3.379999999999866 | 1.932 | 2.61 | 3.012 |
| 3.384999999999866 | 1.934 | 2.611 | 3.014 |
| 3.389999999999866 | 1.935 | 2.613 | 3.015 |
| 3.394999999999865 | 1.936 | 2.614 | 3.016 |
| 3.399999999999865 | 1.938 | 2.615 | 3.018 |
| 3.404999999999865 | 1.939 | 2.617 | 3.019 |
| 3.409999999999865 | 1.941 | 2.618 | 3.021 |
| 3.414999999999865 | 1.942 | 2.62 | 3.022 |
| 3.419999999999865 | 1.944 | 2.621 | 3.024 |
| 3.424999999999865 | 1.945 | 2.623 | 3.025 |
| 3.429999999999865 | 1.946 | 2.624 | 3.027 |
| 3.434999999999865 | 1.948 | 2.626 | 3.028 |
| 3.439999999999864 | 1.949 | 2.627 | 3.03 |
| 3.444999999999864 | 1.951 | 2.628 | 3.031 |
| 3.449999999999864 | 1.952 | 2.63 | 3.032 |
| 3.454999999999864 | 1.953 | 2.631 | 3.034 |
| 3.459999999999864 | 1.955 | 2.633 | 3.035 |
| 3.464999999999864 | 1.956 | 2.634 | 3.037 |
| 3.469999999999864 | 1.957 | 2.636 | 3.038 |
| 3.474999999999864 | 1.959 | 2.637 | 3.04 |
| 3.479999999999864 | 1.96 | 2.638 | 3.041 |
| 3.484999999999864 | 1.962 | 2.64 | 3.043 |
| 3.489999999999863 | 1.963 | 2.641 | 3.044 |
| 3.494999999999863 | 1.964 | 2.643 | 3.045 |
| 3.499999999999863 | 1.966 | 2.644 | 3.047 |
| 3.504999999999863 | 1.967 | 2.646 | 3.048 |
| 3.509999999999863 | 1.968 | 2.647 | 3.05 |
| 3.514999999999863 | 1.97 | 2.648 | 3.051 |
| 3.519999999999863 | 1.971 | 2.65 | 3.052 |
| 3.524999999999863 | 1.973 | 2.651 | 3.054 |
| 3.529999999999863 | 1.974 | 2.653 | 3.055 |
| 3.534999999999862 | 1.975 | 2.654 | 3.057 |
| 3.539999999999862 | 1.977 | 2.655 | 3.058 |
| 3.544999999999862 | 1.978 | 2.657 | 3.06 |
| 3.549999999999862 | 1.979 | 2.658 | 3.061 |
| 3.554999999999862 | 1.981 | 2.66 | 3.062 |
| 3.559999999999862 | 1.982 | 2.661 | 3.064 |
| 3.564999999999862 | 1.983 | 2.662 | 3.065 |
| 3.569999999999862 | 1.985 | 2.664 | 3.066 |
| 3.574999999999862 | 1.986 | 2.665 | 3.068 |
| 3.579999999999862 | 1.987 | 2.666 | 3.069 |
| 3.584999999999861 | 1.989 | 2.668 | 3.071 |
| 3.589999999999861 | 1.99 | 2.669 | 3.072 |
| 3.594999999999861 | 1.991 | 2.671 | 3.073 |
| 3.599999999999861 | 1.993 | 2.672 | 3.075 |
| 3.604999999999861 | 1.994 | 2.673 | 3.076 |
| 3.609999999999861 | 1.996 | 2.675 | 3.078 |
| 3.614999999999861 | 1.997 | 2.676 | 3.079 |
| 3.619999999999861 | 1.998 | 2.678 | 3.08 |
| 3.62499999999986 | 2 | 2.679 | 3.082 |
| 3.62999999999986 | 2.001 | 2.68 | 3.083 |
| 3.63499999999986 | 2.002 | 2.682 | 3.084 |
| 3.63999999999986 | 2.003 | 2.683 | 3.086 |
| 3.64499999999986 | 2.005 | 2.684 | 3.087 |
| 3.64999999999986 | 2.006 | 2.686 | 3.089 |
| 3.65499999999986 | 2.007 | 2.687 | 3.09 |
| 3.65999999999986 | 2.009 | 2.688 | 3.091 |
| 3.66499999999986 | 2.01 | 2.69 | 3.093 |
| 3.669999999999859 | 2.011 | 2.691 | 3.094 |
| 3.674999999999859 | 2.013 | 2.692 | 3.095 |
| 3.679999999999859 | 2.014 | 2.694 | 3.097 |
| 3.684999999999859 | 2.015 | 2.695 | 3.098 |
| 3.689999999999859 | 2.017 | 2.696 | 3.099 |
| 3.694999999999859 | 2.018 | 2.698 | 3.101 |
| 3.699999999999859 | 2.019 | 2.699 | 3.102 |
| 3.704999999999859 | 2.021 | 2.7 | 3.103 |
| 3.709999999999859 | 2.022 | 2.702 | 3.105 |
| 3.714999999999859 | 2.023 | 2.703 | 3.106 |
| 3.719999999999858 | 2.024 | 2.705 | 3.107 |
| 3.724999999999858 | 2.026 | 2.706 | 3.109 |
| 3.729999999999858 | 2.027 | 2.707 | 3.11 |
| 3.734999999999858 | 2.028 | 2.708 | 3.111 |
| 3.739999999999858 | 2.03 | 2.71 | 3.113 |
| 3.744999999999858 | 2.031 | 2.711 | 3.114 |
| 3.749999999999858 | 2.032 | 2.712 | 3.115 |
| 3.754999999999858 | 2.034 | 2.714 | 3.117 |
| 3.759999999999858 | 2.035 | 2.715 | 3.118 |
| 3.764999999999857 | 2.036 | 2.716 | 3.119 |
| 3.769999999999857 | 2.037 | 2.718 | 3.121 |
| 3.774999999999857 | 2.039 | 2.719 | 3.122 |
| 3.779999999999857 | 2.04 | 2.72 | 3.123 |
| 3.784999999999857 | 2.041 | 2.722 | 3.125 |
| 3.789999999999857 | 2.042 | 2.723 | 3.126 |
| 3.794999999999857 | 2.044 | 2.724 | 3.127 |
| 3.799999999999857 | 2.045 | 2.726 | 3.129 |
| 3.804999999999857 | 2.046 | 2.727 | 3.13 |
| 3.809999999999857 | 2.048 | 2.728 | 3.131 |
| 3.814999999999856 | 2.049 | 2.73 | 3.133 |
| 3.819999999999856 | 2.05 | 2.731 | 3.134 |
| 3.824999999999856 | 2.051 | 2.732 | 3.135 |
| 3.829999999999856 | 2.053 | 2.733 | 3.137 |
| 3.834999999999856 | 2.054 | 2.735 | 3.138 |
| 3.839999999999856 | 2.055 | 2.736 | 3.139 |
| 3.844999999999856 | 2.056 | 2.737 | 3.14 |
| 3.849999999999856 | 2.058 | 2.739 | 3.142 |
| 3.854999999999856 | 2.059 | 2.74 | 3.143 |
| 3.859999999999855 | 2.06 | 2.741 | 3.144 |
| 3.864999999999855 | 2.061 | 2.742 | 3.146 |
| 3.869999999999855 | 2.063 | 2.744 | 3.147 |
| 3.874999999999855 | 2.064 | 2.745 | 3.148 |
| 3.879999999999855 | 2.065 | 2.746 | 3.149 |
| 3.884999999999855 | 2.066 | 2.748 | 3.151 |
| 3.889999999999855 | 2.068 | 2.749 | 3.152 |
| 3.894999999999855 | 2.069 | 2.75 | 3.153 |
| 3.899999999999855 | 2.07 | 2.751 | 3.155 |
| 3.904999999999855 | 2.071 | 2.753 | 3.156 |
| 3.909999999999854 | 2.073 | 2.754 | 3.157 |
| 3.914999999999854 | 2.074 | 2.755 | 3.158 |
| 3.919999999999854 | 2.075 | 2.756 | 3.16 |
| 3.924999999999854 | 2.076 | 2.758 | 3.161 |
| 3.929999999999854 | 2.078 | 2.759 | 3.162 |
| 3.934999999999854 | 2.079 | 2.76 | 3.163 |
| 3.939999999999854 | 2.08 | 2.761 | 3.165 |
| 3.944999999999854 | 2.081 | 2.763 | 3.166 |
| 3.949999999999854 | 2.083 | 2.764 | 3.167 |
| 3.954999999999853 | 2.084 | 2.765 | 3.169 |
| 3.959999999999853 | 2.085 | 2.767 | 3.17 |
| 3.964999999999853 | 2.086 | 2.768 | 3.171 |
| 3.969999999999853 | 2.087 | 2.769 | 3.172 |
| 3.974999999999853 | 2.089 | 2.77 | 3.174 |
| 3.979999999999853 | 2.09 | 2.771 | 3.175 |
| 3.984999999999853 | 2.091 | 2.773 | 3.176 |
| 3.989999999999853 | 2.092 | 2.774 | 3.177 |
| 3.994999999999853 | 2.093 | 2.775 | 3.179 |
| 3.999999999999853 | 2.095 | 2.776 | 3.18 |
| 4.004999999999852 | 2.096 | 2.778 | 3.181 |
| 4.009999999999852 | 2.097 | 2.779 | 3.182 |
| 4.014999999999852 | 2.098 | 2.78 | 3.184 |
| 4.019999999999852 | 2.1 | 2.781 | 3.185 |
| 4.024999999999852 | 2.101 | 2.783 | 3.186 |
| 4.029999999999852 | 2.102 | 2.784 | 3.187 |
| 4.034999999999852 | 2.103 | 2.785 | 3.188 |
| 4.039999999999851 | 2.104 | 2.786 | 3.19 |
| 4.044999999999852 | 2.106 | 2.788 | 3.191 |
| 4.049999999999851 | 2.107 | 2.789 | 3.192 |
| 4.054999999999851 | 2.108 | 2.79 | 3.193 |
| 4.059999999999851 | 2.109 | 2.791 | 3.195 |
| 4.064999999999851 | 2.11 | 2.792 | 3.196 |
| 4.069999999999851 | 2.112 | 2.794 | 3.197 |
| 4.074999999999851 | 2.113 | 2.795 | 3.198 |
| 4.07999999999985 | 2.114 | 2.796 | 3.2 |
| 4.084999999999851 | 2.115 | 2.797 | 3.201 |
| 4.08999999999985 | 2.116 | 2.799 | 3.202 |
| 4.094999999999851 | 2.117 | 2.8 | 3.203 |
| 4.09999999999985 | 2.119 | 2.801 | 3.204 |
| 4.10499999999985 | 2.12 | 2.802 | 3.206 |
| 4.10999999999985 | 2.121 | 2.803 | 3.207 |
| 4.11499999999985 | 2.122 | 2.805 | 3.208 |
| 4.11999999999985 | 2.123 | 2.806 | 3.209 |
| 4.12499999999985 | 2.125 | 2.807 | 3.21 |
| 4.12999999999985 | 2.126 | 2.808 | 3.212 |
| 4.13499999999985 | 2.127 | 2.809 | 3.213 |
| 4.13999999999985 | 2.128 | 2.811 | 3.214 |
| 4.144999999999849 | 2.129 | 2.812 | 3.215 |
| 4.14999999999985 | 2.13 | 2.813 | 3.216 |
| 4.154999999999849 | 2.132 | 2.814 | 3.218 |
| 4.15999999999985 | 2.133 | 2.815 | 3.219 |
| 4.164999999999849 | 2.134 | 2.817 | 3.22 |
| 4.169999999999849 | 2.135 | 2.818 | 3.221 |
| 4.174999999999849 | 2.136 | 2.819 | 3.222 |
| 4.179999999999848 | 2.137 | 2.82 | 3.224 |
| 4.184999999999849 | 2.139 | 2.821 | 3.225 |
| 4.189999999999848 | 2.14 | 2.823 | 3.226 |
| 4.194999999999848 | 2.141 | 2.824 | 3.227 |
| 4.199999999999848 | 2.142 | 2.825 | 3.228 |
| 4.204999999999848 | 2.143 | 2.826 | 3.23 |
| 4.209999999999848 | 2.144 | 2.827 | 3.231 |
| 4.214999999999848 | 2.146 | 2.828 | 3.232 |
| 4.219999999999847 | 2.147 | 2.83 | 3.233 |
| 4.224999999999848 | 2.148 | 2.831 | 3.234 |
| 4.229999999999847 | 2.149 | 2.832 | 3.236 |
| 4.234999999999847 | 2.15 | 2.833 | 3.237 |
| 4.239999999999847 | 2.151 | 2.834 | 3.238 |
| 4.244999999999847 | 2.152 | 2.835 | 3.239 |
| 4.249999999999847 | 2.154 | 2.837 | 3.24 |
| 4.254999999999847 | 2.155 | 2.838 | 3.241 |
| 4.259999999999846 | 2.156 | 2.839 | 3.243 |
| 4.264999999999847 | 2.157 | 2.84 | 3.244 |
| 4.269999999999846 | 2.158 | 2.841 | 3.245 |
| 4.274999999999846 | 2.159 | 2.842 | 3.246 |
| 4.279999999999846 | 2.16 | 2.844 | 3.247 |
| 4.284999999999846 | 2.162 | 2.845 | 3.248 |
| 4.289999999999846 | 2.163 | 2.846 | 3.25 |
| 4.294999999999846 | 2.164 | 2.847 | 3.251 |
| 4.299999999999846 | 2.165 | 2.848 | 3.252 |
| 4.304999999999846 | 2.166 | 2.849 | 3.253 |
| 4.309999999999845 | 2.167 | 2.851 | 3.254 |
| 4.314999999999846 | 2.168 | 2.852 | 3.255 |
| 4.319999999999845 | 2.17 | 2.853 | 3.256 |
| 4.324999999999846 | 2.171 | 2.854 | 3.258 |
| 4.329999999999845 | 2.172 | 2.855 | 3.259 |
| 4.334999999999845 | 2.173 | 2.856 | 3.26 |
| 4.339999999999845 | 2.174 | 2.857 | 3.261 |
| 4.344999999999845 | 2.175 | 2.859 | 3.262 |
| 4.349999999999845 | 2.176 | 2.86 | 3.263 |
| 4.354999999999845 | 2.177 | 2.861 | 3.265 |
| 4.359999999999844 | 2.179 | 2.862 | 3.266 |
| 4.364999999999845 | 2.18 | 2.863 | 3.267 |
| 4.369999999999844 | 2.181 | 2.864 | 3.268 |
| 4.374999999999844 | 2.182 | 2.865 | 3.269 |
| 4.379999999999844 | 2.183 | 2.867 | 3.27 |
| 4.384999999999844 | 2.184 | 2.868 | 3.271 |
| 4.389999999999844 | 2.185 | 2.869 | 3.273 |
| 4.394999999999844 | 2.186 | 2.87 | 3.274 |
| 4.399999999999844 | 2.187 | 2.871 | 3.275 |
| 4.404999999999844 | 2.189 | 2.872 | 3.276 |
| 4.409999999999843 | 2.19 | 2.873 | 3.277 |
| 4.414999999999844 | 2.191 | 2.874 | 3.278 |
| 4.419999999999843 | 2.192 | 2.876 | 3.279 |
| 4.424999999999843 | 2.193 | 2.877 | 3.28 |
| 4.429999999999843 | 2.194 | 2.878 | 3.282 |
| 4.434999999999843 | 2.195 | 2.879 | 3.283 |
| 4.439999999999843 | 2.196 | 2.88 | 3.284 |
| 4.444999999999843 | 2.197 | 2.881 | 3.285 |
| 4.449999999999842 | 2.198 | 2.882 | 3.286 |
| 4.454999999999843 | 2.2 | 2.883 | 3.287 |
| 4.459999999999842 | 2.201 | 2.885 | 3.288 |
| 4.464999999999843 | 2.202 | 2.886 | 3.289 |
| 4.469999999999842 | 2.203 | 2.887 | 3.291 |
| 4.474999999999842 | 2.204 | 2.888 | 3.292 |
| 4.479999999999842 | 2.205 | 2.889 | 3.293 |
| 4.484999999999842 | 2.206 | 2.89 | 3.294 |
| 4.489999999999842 | 2.207 | 2.891 | 3.295 |
| 4.494999999999842 | 2.208 | 2.892 | 3.296 |
| 4.499999999999841 | 2.209 | 2.893 | 3.297 |
| 4.504999999999842 | 2.21 | 2.895 | 3.298 |
| 4.509999999999841 | 2.212 | 2.896 | 3.299 |
| 4.514999999999842 | 2.213 | 2.897 | 3.301 |
| 4.519999999999841 | 2.214 | 2.898 | 3.302 |
| 4.524999999999841 | 2.215 | 2.899 | 3.303 |
| 4.529999999999841 | 2.216 | 2.9 | 3.304 |
| 4.534999999999841 | 2.217 | 2.901 | 3.305 |
| 4.53999999999984 | 2.218 | 2.902 | 3.306 |
| 4.544999999999841 | 2.219 | 2.903 | 3.307 |
| 4.54999999999984 | 2.22 | 2.904 | 3.308 |
| 4.554999999999841 | 2.221 | 2.906 | 3.309 |
| 4.55999999999984 | 2.222 | 2.907 | 3.31 |
| 4.564999999999841 | 2.223 | 2.908 | 3.312 |
| 4.56999999999984 | 2.224 | 2.909 | 3.313 |
| 4.57499999999984 | 2.225 | 2.91 | 3.314 |
| 4.57999999999984 | 2.227 | 2.911 | 3.315 |
| 4.58499999999984 | 2.228 | 2.912 | 3.316 |
| 4.58999999999984 | 2.229 | 2.913 | 3.317 |
| 4.59499999999984 | 2.23 | 2.914 | 3.318 |
| 4.59999999999984 | 2.231 | 2.915 | 3.319 |
| 4.60499999999984 | 2.232 | 2.916 | 3.32 |
| 4.60999999999984 | 2.233 | 2.917 | 3.321 |
| 4.614999999999839 | 2.234 | 2.919 | 3.322 |
| 4.61999999999984 | 2.235 | 2.92 | 3.323 |
| 4.624999999999839 | 2.236 | 2.921 | 3.325 |
| 4.62999999999984 | 2.237 | 2.922 | 3.326 |
| 4.634999999999839 | 2.238 | 2.923 | 3.327 |
| 4.639999999999838 | 2.239 | 2.924 | 3.328 |
| 4.644999999999839 | 2.24 | 2.925 | 3.329 |
| 4.649999999999838 | 2.241 | 2.926 | 3.33 |
| 4.654999999999839 | 2.242 | 2.927 | 3.331 |
| 4.659999999999838 | 2.243 | 2.928 | 3.332 |
| 4.664999999999838 | 2.245 | 2.929 | 3.333 |
| 4.669999999999838 | 2.246 | 2.93 | 3.334 |
| 4.674999999999838 | 2.247 | 2.931 | 3.335 |
| 4.679999999999837 | 2.248 | 2.932 | 3.336 |
| 4.684999999999838 | 2.249 | 2.933 | 3.337 |
| 4.689999999999837 | 2.25 | 2.935 | 3.338 |
| 4.694999999999838 | 2.251 | 2.936 | 3.34 |
| 4.699999999999837 | 2.252 | 2.937 | 3.341 |
| 4.704999999999837 | 2.253 | 2.938 | 3.342 |
| 4.709999999999837 | 2.254 | 2.939 | 3.343 |
| 4.714999999999837 | 2.255 | 2.94 | 3.344 |
| 4.719999999999837 | 2.256 | 2.941 | 3.345 |
| 4.724999999999837 | 2.257 | 2.942 | 3.346 |
| 4.729999999999836 | 2.258 | 2.943 | 3.347 |
| 4.734999999999836 | 2.259 | 2.944 | 3.348 |
| 4.739999999999836 | 2.26 | 2.945 | 3.349 |
| 4.744999999999836 | 2.261 | 2.946 | 3.35 |
| 4.749999999999836 | 2.262 | 2.947 | 3.351 |
| 4.754999999999836 | 2.263 | 2.948 | 3.352 |
| 4.759999999999836 | 2.264 | 2.949 | 3.353 |
| 4.764999999999836 | 2.265 | 2.95 | 3.354 |
| 4.769999999999836 | 2.266 | 2.951 | 3.355 |
| 4.774999999999835 | 2.267 | 2.952 | 3.356 |
| 4.779999999999835 | 2.268 | 2.953 | 3.357 |
| 4.784999999999835 | 2.269 | 2.954 | 3.358 |
| 4.789999999999835 | 2.27 | 2.956 | 3.359 |
| 4.794999999999835 | 2.271 | 2.957 | 3.361 |
| 4.799999999999835 | 2.272 | 2.958 | 3.362 |
| 4.804999999999835 | 2.273 | 2.959 | 3.363 |
| 4.809999999999835 | 2.274 | 2.96 | 3.364 |
| 4.814999999999835 | 2.275 | 2.961 | 3.365 |
| 4.819999999999835 | 2.277 | 2.962 | 3.366 |
| 4.824999999999835 | 2.278 | 2.963 | 3.367 |
| 4.829999999999834 | 2.279 | 2.964 | 3.368 |
| 4.834999999999834 | 2.28 | 2.965 | 3.369 |
| 4.839999999999834 | 2.281 | 2.966 | 3.37 |
| 4.844999999999834 | 2.282 | 2.967 | 3.371 |
| 4.849999999999834 | 2.283 | 2.968 | 3.372 |
| 4.854999999999834 | 2.284 | 2.969 | 3.373 |
| 4.859999999999834 | 2.285 | 2.97 | 3.374 |
| 4.864999999999834 | 2.286 | 2.971 | 3.375 |
| 4.869999999999834 | 2.287 | 2.972 | 3.376 |
| 4.874999999999834 | 2.288 | 2.973 | 3.377 |
| 4.879999999999833 | 2.289 | 2.974 | 3.378 |
| 4.884999999999834 | 2.29 | 2.975 | 3.379 |
| 4.889999999999833 | 2.291 | 2.976 | 3.38 |
| 4.894999999999833 | 2.292 | 2.977 | 3.381 |
| 4.899999999999833 | 2.293 | 2.978 | 3.382 |
| 4.904999999999833 | 2.294 | 2.979 | 3.383 |
| 4.909999999999833 | 2.295 | 2.98 | 3.384 |
| 4.914999999999833 | 2.296 | 2.981 | 3.385 |
| 4.919999999999832 | 2.297 | 2.982 | 3.386 |
| 4.924999999999833 | 2.298 | 2.983 | 3.387 |
| 4.929999999999832 | 2.299 | 2.984 | 3.388 |
| 4.934999999999832 | 2.3 | 2.985 | 3.389 |
| 4.939999999999832 | 2.301 | 2.986 | 3.39 |
| 4.944999999999832 | 2.302 | 2.987 | 3.391 |
| 4.949999999999832 | 2.303 | 2.988 | 3.392 |
| 4.954999999999832 | 2.304 | 2.989 | 3.393 |
| 4.959999999999832 | 2.305 | 2.99 | 3.394 |
| 4.964999999999832 | 2.306 | 2.991 | 3.395 |
| 4.969999999999831 | 2.307 | 2.992 | 3.396 |
| 4.974999999999831 | 2.308 | 2.993 | 3.397 |
| 4.97999999999983 | 2.309 | 2.994 | 3.398 |
| 4.984999999999831 | 2.309 | 2.995 | 3.399 |
| 4.98999999999983 | 2.31 | 2.996 | 3.4 |
| 4.994999999999831 | 2.311 | 2.997 | 3.401 |
| 4.99999999999983 | 2.312 | 2.998 | 3.402 |